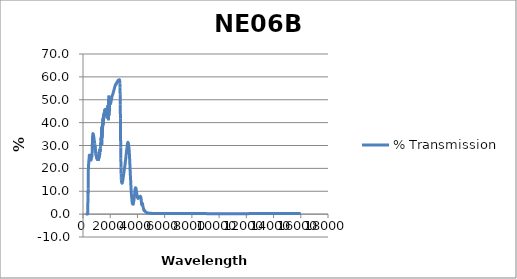
| Category | % Transmission |
|---|---|
| 200.0 | 0 |
| 201.0 | 0 |
| 202.0 | 0 |
| 203.0 | 0 |
| 204.0 | 0 |
| 205.0 | 0 |
| 206.0 | 0 |
| 207.0 | 0 |
| 208.0 | 0 |
| 209.0 | 0 |
| 210.0 | 0 |
| 211.0 | 0 |
| 212.0 | 0 |
| 213.0 | 0 |
| 214.0 | 0 |
| 215.0 | 0 |
| 216.0 | 0 |
| 217.0 | 0 |
| 218.0 | 0 |
| 219.0 | 0 |
| 220.0 | 0 |
| 221.0 | 0 |
| 222.0 | 0 |
| 223.0 | 0 |
| 224.0 | 0 |
| 225.0 | 0 |
| 226.0 | 0 |
| 227.0 | 0 |
| 228.0 | 0 |
| 229.0 | 0 |
| 230.0 | 0 |
| 231.0 | 0 |
| 232.0 | 0 |
| 233.0 | 0 |
| 234.0 | 0 |
| 235.0 | 0 |
| 236.0 | 0 |
| 237.0 | 0 |
| 238.0 | 0 |
| 239.0 | 0 |
| 240.0 | 0 |
| 241.0 | 0 |
| 242.0 | 0 |
| 243.0 | 0 |
| 244.0 | 0 |
| 245.0 | 0 |
| 246.0 | 0 |
| 247.0 | 0 |
| 248.0 | 0 |
| 249.0 | 0 |
| 250.0 | 0 |
| 251.0 | 0 |
| 252.0 | 0 |
| 253.0 | 0 |
| 254.0 | 0 |
| 255.0 | 0 |
| 256.0 | 0 |
| 257.0 | 0 |
| 258.0 | 0 |
| 259.0 | 0 |
| 260.0 | 0 |
| 261.0 | 0 |
| 262.0 | 0 |
| 263.0 | 0 |
| 264.0 | 0 |
| 265.0 | 0 |
| 266.0 | 0 |
| 267.0 | 0 |
| 268.0 | 0 |
| 269.0 | 0 |
| 270.0 | 0 |
| 271.0 | 0 |
| 272.0 | 0 |
| 273.0 | 0 |
| 274.0 | 0 |
| 275.0 | 0 |
| 276.0 | 0 |
| 277.0 | 0 |
| 278.0 | 0 |
| 279.0 | 0 |
| 280.0 | 0 |
| 281.0 | 0 |
| 282.0 | 0 |
| 283.0 | 0 |
| 284.0 | 0 |
| 285.0 | 0 |
| 286.0 | 0 |
| 287.0 | 0 |
| 288.0 | 0 |
| 289.0 | 0 |
| 290.0 | 0 |
| 291.0 | 0 |
| 292.0 | 0 |
| 293.0 | 0 |
| 294.0 | 0 |
| 295.0 | 0 |
| 296.0 | 0 |
| 297.0 | 0 |
| 298.0 | 0 |
| 299.0 | 0 |
| 300.0 | 0 |
| 301.0 | 0 |
| 302.0 | 0 |
| 303.0 | 0 |
| 304.0 | 0 |
| 305.0 | 0 |
| 306.0 | 0 |
| 307.0 | 0 |
| 308.0 | 0 |
| 309.0 | 0 |
| 310.0 | 0 |
| 311.0 | 0 |
| 312.0 | 0 |
| 313.0 | 0 |
| 314.0 | 0 |
| 315.0 | 0 |
| 316.0 | 0 |
| 317.0 | 0 |
| 318.0 | 0 |
| 319.0 | 0 |
| 320.0 | 0 |
| 321.0 | 0 |
| 322.0 | 0 |
| 323.0 | 0 |
| 324.0 | 0 |
| 325.0 | 0 |
| 326.0 | 0.001 |
| 327.0 | 0.001 |
| 328.0 | 0.002 |
| 329.0 | 0.004 |
| 330.0 | 0.006 |
| 331.0 | 0.01 |
| 332.0 | 0.016 |
| 333.0 | 0.024 |
| 334.0 | 0.035 |
| 335.0 | 0.051 |
| 336.0 | 0.073 |
| 337.0 | 0.102 |
| 338.0 | 0.141 |
| 339.0 | 0.189 |
| 340.0 | 0.251 |
| 341.0 | 0.326 |
| 342.0 | 0.416 |
| 343.0 | 0.523 |
| 344.0 | 0.648 |
| 345.0 | 0.793 |
| 346.0 | 0.96 |
| 347.0 | 1.151 |
| 348.0 | 1.368 |
| 349.0 | 1.612 |
| 350.0 | 1.881 |
| 351.0 | 2.171 |
| 352.0 | 2.48 |
| 353.0 | 2.808 |
| 354.0 | 3.157 |
| 355.0 | 3.532 |
| 356.0 | 3.931 |
| 357.0 | 4.351 |
| 358.0 | 4.788 |
| 359.0 | 5.241 |
| 360.0 | 5.709 |
| 361.0 | 6.193 |
| 362.0 | 6.681 |
| 363.0 | 7.162 |
| 364.0 | 7.629 |
| 365.0 | 8.079 |
| 366.0 | 8.518 |
| 367.0 | 8.938 |
| 368.0 | 9.319 |
| 369.0 | 9.631 |
| 370.0 | 9.847 |
| 371.0 | 9.956 |
| 372.0 | 9.961 |
| 373.0 | 9.874 |
| 374.0 | 9.721 |
| 375.0 | 9.54 |
| 376.0 | 9.386 |
| 377.0 | 9.319 |
| 378.0 | 9.386 |
| 379.0 | 9.607 |
| 380.0 | 9.984 |
| 381.0 | 10.5 |
| 382.0 | 11.128 |
| 383.0 | 11.832 |
| 384.0 | 12.58 |
| 385.0 | 13.34 |
| 386.0 | 14.097 |
| 387.0 | 14.848 |
| 388.0 | 15.586 |
| 389.0 | 16.295 |
| 390.0 | 16.955 |
| 391.0 | 17.555 |
| 392.0 | 18.1 |
| 393.0 | 18.603 |
| 394.0 | 19.082 |
| 395.0 | 19.526 |
| 396.0 | 19.921 |
| 397.0 | 20.263 |
| 398.0 | 20.562 |
| 399.0 | 20.832 |
| 400.0 | 21.075 |
| 401.0 | 21.286 |
| 402.0 | 21.449 |
| 403.0 | 21.557 |
| 404.0 | 21.618 |
| 405.0 | 21.651 |
| 406.0 | 21.672 |
| 407.0 | 21.684 |
| 408.0 | 21.682 |
| 409.0 | 21.665 |
| 410.0 | 21.639 |
| 411.0 | 21.629 |
| 412.0 | 21.648 |
| 413.0 | 21.689 |
| 414.0 | 21.732 |
| 415.0 | 21.768 |
| 416.0 | 21.81 |
| 417.0 | 21.873 |
| 418.0 | 21.967 |
| 419.0 | 22.078 |
| 420.0 | 22.187 |
| 421.0 | 22.286 |
| 422.0 | 22.383 |
| 423.0 | 22.5 |
| 424.0 | 22.638 |
| 425.0 | 22.782 |
| 426.0 | 22.905 |
| 427.0 | 22.995 |
| 428.0 | 23.064 |
| 429.0 | 23.131 |
| 430.0 | 23.205 |
| 431.0 | 23.27 |
| 432.0 | 23.302 |
| 433.0 | 23.292 |
| 434.0 | 23.258 |
| 435.0 | 23.225 |
| 436.0 | 23.202 |
| 437.0 | 23.189 |
| 438.0 | 23.166 |
| 439.0 | 23.138 |
| 440.0 | 23.122 |
| 441.0 | 23.143 |
| 442.0 | 23.209 |
| 443.0 | 23.3 |
| 444.0 | 23.402 |
| 445.0 | 23.505 |
| 446.0 | 23.625 |
| 447.0 | 23.777 |
| 448.0 | 23.961 |
| 449.0 | 24.154 |
| 450.0 | 24.33 |
| 451.0 | 24.48 |
| 452.0 | 24.617 |
| 453.0 | 24.76 |
| 454.0 | 24.913 |
| 455.0 | 25.066 |
| 456.0 | 25.197 |
| 457.0 | 25.305 |
| 458.0 | 25.403 |
| 459.0 | 25.508 |
| 460.0 | 25.619 |
| 461.0 | 25.709 |
| 462.0 | 25.758 |
| 463.0 | 25.764 |
| 464.0 | 25.753 |
| 465.0 | 25.75 |
| 466.0 | 25.758 |
| 467.0 | 25.759 |
| 468.0 | 25.729 |
| 469.0 | 25.671 |
| 470.0 | 25.604 |
| 471.0 | 25.545 |
| 472.0 | 25.5 |
| 473.0 | 25.458 |
| 474.0 | 25.404 |
| 475.0 | 25.343 |
| 476.0 | 25.287 |
| 477.0 | 25.246 |
| 478.0 | 25.215 |
| 479.0 | 25.17 |
| 480.0 | 25.096 |
| 481.0 | 25 |
| 482.0 | 24.909 |
| 483.0 | 24.849 |
| 484.0 | 24.817 |
| 485.0 | 24.794 |
| 486.0 | 24.761 |
| 487.0 | 24.705 |
| 488.0 | 24.637 |
| 489.0 | 24.569 |
| 490.0 | 24.505 |
| 491.0 | 24.446 |
| 492.0 | 24.384 |
| 493.0 | 24.33 |
| 494.0 | 24.29 |
| 495.0 | 24.269 |
| 496.0 | 24.264 |
| 497.0 | 24.254 |
| 498.0 | 24.225 |
| 499.0 | 24.179 |
| 500.0 | 24.135 |
| 501.0 | 24.11 |
| 502.0 | 24.101 |
| 503.0 | 24.094 |
| 504.0 | 24.075 |
| 505.0 | 24.044 |
| 506.0 | 24.019 |
| 507.0 | 24.018 |
| 508.0 | 24.04 |
| 509.0 | 24.072 |
| 510.0 | 24.092 |
| 511.0 | 24.094 |
| 512.0 | 24.091 |
| 513.0 | 24.096 |
| 514.0 | 24.119 |
| 515.0 | 24.15 |
| 516.0 | 24.173 |
| 517.0 | 24.19 |
| 518.0 | 24.211 |
| 519.0 | 24.255 |
| 520.0 | 24.319 |
| 521.0 | 24.384 |
| 522.0 | 24.435 |
| 523.0 | 24.47 |
| 524.0 | 24.51 |
| 525.0 | 24.564 |
| 526.0 | 24.629 |
| 527.0 | 24.695 |
| 528.0 | 24.747 |
| 529.0 | 24.802 |
| 530.0 | 24.868 |
| 531.0 | 24.952 |
| 532.0 | 25.048 |
| 533.0 | 25.136 |
| 534.0 | 25.207 |
| 535.0 | 25.264 |
| 536.0 | 25.31 |
| 537.0 | 25.353 |
| 538.0 | 25.397 |
| 539.0 | 25.44 |
| 540.0 | 25.484 |
| 541.0 | 25.522 |
| 542.0 | 25.555 |
| 543.0 | 25.587 |
| 544.0 | 25.62 |
| 545.0 | 25.66 |
| 546.0 | 25.696 |
| 547.0 | 25.717 |
| 548.0 | 25.721 |
| 549.0 | 25.711 |
| 550.0 | 25.703 |
| 551.0 | 25.706 |
| 552.0 | 25.714 |
| 553.0 | 25.707 |
| 554.0 | 25.67 |
| 555.0 | 25.62 |
| 556.0 | 25.573 |
| 557.0 | 25.539 |
| 558.0 | 25.512 |
| 559.0 | 25.475 |
| 560.0 | 25.422 |
| 561.0 | 25.363 |
| 562.0 | 25.308 |
| 563.0 | 25.252 |
| 564.0 | 25.192 |
| 565.0 | 25.129 |
| 566.0 | 25.067 |
| 567.0 | 25.008 |
| 568.0 | 24.945 |
| 569.0 | 24.88 |
| 570.0 | 24.812 |
| 571.0 | 24.741 |
| 572.0 | 24.669 |
| 573.0 | 24.591 |
| 574.0 | 24.508 |
| 575.0 | 24.429 |
| 576.0 | 24.353 |
| 577.0 | 24.278 |
| 578.0 | 24.194 |
| 579.0 | 24.108 |
| 580.0 | 24.031 |
| 581.0 | 23.964 |
| 582.0 | 23.903 |
| 583.0 | 23.84 |
| 584.0 | 23.776 |
| 585.0 | 23.72 |
| 586.0 | 23.685 |
| 587.0 | 23.671 |
| 588.0 | 23.659 |
| 589.0 | 23.642 |
| 590.0 | 23.621 |
| 591.0 | 23.607 |
| 592.0 | 23.609 |
| 593.0 | 23.617 |
| 594.0 | 23.624 |
| 595.0 | 23.626 |
| 596.0 | 23.632 |
| 597.0 | 23.66 |
| 598.0 | 23.708 |
| 599.0 | 23.767 |
| 600.0 | 23.819 |
| 601.0 | 23.853 |
| 602.0 | 23.875 |
| 603.0 | 23.892 |
| 604.0 | 23.918 |
| 605.0 | 23.961 |
| 606.0 | 24.013 |
| 607.0 | 24.066 |
| 608.0 | 24.112 |
| 609.0 | 24.152 |
| 610.0 | 24.192 |
| 611.0 | 24.238 |
| 612.0 | 24.292 |
| 613.0 | 24.347 |
| 614.0 | 24.397 |
| 615.0 | 24.446 |
| 616.0 | 24.496 |
| 617.0 | 24.551 |
| 618.0 | 24.603 |
| 619.0 | 24.643 |
| 620.0 | 24.668 |
| 621.0 | 24.68 |
| 622.0 | 24.696 |
| 623.0 | 24.725 |
| 624.0 | 24.772 |
| 625.0 | 24.821 |
| 626.0 | 24.862 |
| 627.0 | 24.882 |
| 628.0 | 24.884 |
| 629.0 | 24.882 |
| 630.0 | 24.886 |
| 631.0 | 24.896 |
| 632.0 | 24.898 |
| 633.0 | 24.884 |
| 634.0 | 24.856 |
| 635.0 | 24.835 |
| 636.0 | 24.825 |
| 637.0 | 24.83 |
| 638.0 | 24.833 |
| 639.0 | 24.832 |
| 640.0 | 24.829 |
| 641.0 | 24.833 |
| 642.0 | 24.85 |
| 643.0 | 24.873 |
| 644.0 | 24.897 |
| 645.0 | 24.918 |
| 646.0 | 24.934 |
| 647.0 | 24.943 |
| 648.0 | 24.952 |
| 649.0 | 24.968 |
| 650.0 | 24.995 |
| 651.0 | 25.026 |
| 652.0 | 25.05 |
| 653.0 | 25.075 |
| 654.0 | 25.108 |
| 655.0 | 25.155 |
| 656.0 | 25.21 |
| 657.0 | 25.262 |
| 658.0 | 25.309 |
| 659.0 | 25.366 |
| 660.0 | 25.456 |
| 661.0 | 25.569 |
| 662.0 | 25.689 |
| 663.0 | 25.802 |
| 664.0 | 25.909 |
| 665.0 | 26.026 |
| 666.0 | 26.148 |
| 667.0 | 26.294 |
| 668.0 | 26.44 |
| 669.0 | 26.585 |
| 670.0 | 26.737 |
| 671.0 | 26.896 |
| 672.0 | 27.076 |
| 673.0 | 27.267 |
| 674.0 | 27.468 |
| 675.0 | 27.669 |
| 676.0 | 27.873 |
| 677.0 | 28.088 |
| 678.0 | 28.326 |
| 679.0 | 28.563 |
| 680.0 | 28.792 |
| 681.0 | 29.007 |
| 682.0 | 29.211 |
| 683.0 | 29.438 |
| 684.0 | 29.672 |
| 685.0 | 29.919 |
| 686.0 | 30.145 |
| 687.0 | 30.355 |
| 688.0 | 30.573 |
| 689.0 | 30.804 |
| 690.0 | 31.058 |
| 691.0 | 31.301 |
| 692.0 | 31.53 |
| 693.0 | 31.727 |
| 694.0 | 31.911 |
| 695.0 | 32.085 |
| 696.0 | 32.254 |
| 697.0 | 32.424 |
| 698.0 | 32.589 |
| 699.0 | 32.761 |
| 700.0 | 32.926 |
| 701.0 | 33.1 |
| 702.0 | 33.262 |
| 703.0 | 33.411 |
| 704.0 | 33.542 |
| 705.0 | 33.655 |
| 706.0 | 33.773 |
| 707.0 | 33.888 |
| 708.0 | 34.017 |
| 709.0 | 34.124 |
| 710.0 | 34.202 |
| 711.0 | 34.263 |
| 712.0 | 34.327 |
| 713.0 | 34.415 |
| 714.0 | 34.516 |
| 715.0 | 34.609 |
| 716.0 | 34.683 |
| 717.0 | 34.728 |
| 718.0 | 34.776 |
| 719.0 | 34.821 |
| 720.0 | 34.874 |
| 721.0 | 34.926 |
| 722.0 | 34.958 |
| 723.0 | 34.992 |
| 724.0 | 35.014 |
| 725.0 | 35.047 |
| 726.0 | 35.08 |
| 727.0 | 35.097 |
| 728.0 | 35.12 |
| 729.0 | 35.122 |
| 730.0 | 35.136 |
| 731.0 | 35.164 |
| 732.0 | 35.182 |
| 733.0 | 35.198 |
| 734.0 | 35.194 |
| 735.0 | 35.186 |
| 736.0 | 35.177 |
| 737.0 | 35.174 |
| 738.0 | 35.172 |
| 739.0 | 35.162 |
| 740.0 | 35.136 |
| 741.0 | 35.12 |
| 742.0 | 35.112 |
| 743.0 | 35.121 |
| 744.0 | 35.126 |
| 745.0 | 35.112 |
| 746.0 | 35.076 |
| 747.0 | 35.037 |
| 748.0 | 35.019 |
| 749.0 | 35.015 |
| 750.0 | 35.017 |
| 751.0 | 35.005 |
| 752.0 | 34.987 |
| 753.0 | 34.973 |
| 754.0 | 34.967 |
| 755.0 | 34.971 |
| 756.0 | 34.961 |
| 757.0 | 34.933 |
| 758.0 | 34.886 |
| 759.0 | 34.843 |
| 760.0 | 34.806 |
| 761.0 | 34.782 |
| 762.0 | 34.761 |
| 763.0 | 34.73 |
| 764.0 | 34.701 |
| 765.0 | 34.674 |
| 766.0 | 34.656 |
| 767.0 | 34.639 |
| 768.0 | 34.604 |
| 769.0 | 34.56 |
| 770.0 | 34.51 |
| 771.0 | 34.46 |
| 772.0 | 34.428 |
| 773.0 | 34.402 |
| 774.0 | 34.382 |
| 775.0 | 34.355 |
| 776.0 | 34.323 |
| 777.0 | 34.293 |
| 778.0 | 34.261 |
| 779.0 | 34.233 |
| 780.0 | 34.216 |
| 781.0 | 34.187 |
| 782.0 | 34.147 |
| 783.0 | 34.092 |
| 784.0 | 34.028 |
| 785.0 | 33.962 |
| 786.0 | 33.903 |
| 787.0 | 33.859 |
| 788.0 | 33.825 |
| 789.0 | 33.799 |
| 790.0 | 33.78 |
| 791.0 | 33.749 |
| 792.0 | 33.709 |
| 793.0 | 33.664 |
| 794.0 | 33.619 |
| 795.0 | 33.576 |
| 796.0 | 33.532 |
| 797.0 | 33.489 |
| 798.0 | 33.446 |
| 799.0 | 33.412 |
| 800.0 | 33.37 |
| 801.0 | 33.321 |
| 802.0 | 33.266 |
| 803.0 | 33.211 |
| 804.0 | 33.167 |
| 805.0 | 33.129 |
| 806.0 | 33.098 |
| 807.0 | 33.057 |
| 808.0 | 33.005 |
| 809.0 | 32.956 |
| 810.0 | 32.917 |
| 811.0 | 32.888 |
| 812.0 | 32.857 |
| 813.0 | 32.822 |
| 814.0 | 32.781 |
| 815.0 | 32.738 |
| 816.0 | 32.691 |
| 817.0 | 32.631 |
| 818.0 | 32.572 |
| 819.0 | 32.507 |
| 820.0 | 32.458 |
| 821.0 | 32.41 |
| 822.0 | 32.366 |
| 823.0 | 32.337 |
| 824.0 | 32.321 |
| 825.0 | 32.312 |
| 826.0 | 32.289 |
| 827.0 | 32.251 |
| 828.0 | 32.2 |
| 829.0 | 32.137 |
| 830.0 | 32.076 |
| 831.0 | 32.028 |
| 832.0 | 31.987 |
| 833.0 | 31.959 |
| 834.0 | 31.927 |
| 835.0 | 31.891 |
| 836.0 | 31.85 |
| 837.0 | 31.81 |
| 838.0 | 31.778 |
| 839.0 | 31.741 |
| 840.0 | 31.701 |
| 841.0 | 31.656 |
| 842.0 | 31.598 |
| 843.0 | 31.543 |
| 844.0 | 31.481 |
| 845.0 | 31.428 |
| 846.0 | 31.371 |
| 847.0 | 31.31 |
| 848.0 | 31.261 |
| 849.0 | 31.229 |
| 850.0 | 31.215 |
| 851.0 | 31.202 |
| 852.0 | 31.175 |
| 853.0 | 31.124 |
| 854.0 | 31.053 |
| 855.0 | 30.98 |
| 856.0 | 30.922 |
| 857.0 | 30.882 |
| 858.0 | 30.848 |
| 859.0 | 30.762 |
| 860.0 | 30.541 |
| 861.0 | 30.185 |
| 862.0 | 29.792 |
| 863.0 | 29.55 |
| 864.0 | 29.58 |
| 865.0 | 29.873 |
| 866.0 | 30.21 |
| 867.0 | 30.339 |
| 868.0 | 30.178 |
| 869.0 | 29.789 |
| 870.0 | 29.372 |
| 871.0 | 29.097 |
| 872.0 | 29.055 |
| 873.0 | 29.205 |
| 874.0 | 29.428 |
| 875.0 | 29.609 |
| 876.0 | 29.661 |
| 877.0 | 29.567 |
| 878.0 | 29.399 |
| 879.0 | 29.265 |
| 880.0 | 29.234 |
| 881.0 | 29.316 |
| 882.0 | 29.419 |
| 883.0 | 29.41 |
| 884.0 | 29.247 |
| 885.0 | 29.044 |
| 886.0 | 28.96 |
| 887.0 | 29.005 |
| 888.0 | 29.062 |
| 889.0 | 28.985 |
| 890.0 | 28.772 |
| 891.0 | 28.587 |
| 892.0 | 28.588 |
| 893.0 | 28.787 |
| 894.0 | 28.988 |
| 895.0 | 29.001 |
| 896.0 | 28.793 |
| 897.0 | 28.495 |
| 898.0 | 28.324 |
| 899.0 | 28.366 |
| 900.0 | 28.497 |
| 901.0 | 28.513 |
| 902.0 | 28.351 |
| 903.0 | 28.154 |
| 904.0 | 28.095 |
| 905.0 | 28.193 |
| 906.0 | 28.341 |
| 907.0 | 28.413 |
| 908.0 | 28.348 |
| 909.0 | 28.158 |
| 910.0 | 27.906 |
| 911.0 | 27.694 |
| 912.0 | 27.583 |
| 913.0 | 27.573 |
| 914.0 | 27.587 |
| 915.0 | 27.542 |
| 916.0 | 27.49 |
| 917.0 | 27.557 |
| 918.0 | 27.777 |
| 919.0 | 27.964 |
| 920.0 | 27.936 |
| 921.0 | 27.727 |
| 922.0 | 27.535 |
| 923.0 | 27.497 |
| 924.0 | 27.527 |
| 925.0 | 27.477 |
| 926.0 | 27.331 |
| 927.0 | 27.24 |
| 928.0 | 27.309 |
| 929.0 | 27.412 |
| 930.0 | 27.336 |
| 931.0 | 27.034 |
| 932.0 | 26.694 |
| 933.0 | 26.592 |
| 934.0 | 26.753 |
| 935.0 | 26.981 |
| 936.0 | 27.089 |
| 937.0 | 27.026 |
| 938.0 | 26.905 |
| 939.0 | 26.847 |
| 940.0 | 26.867 |
| 941.0 | 26.87 |
| 942.0 | 26.793 |
| 943.0 | 26.667 |
| 944.0 | 26.566 |
| 945.0 | 26.556 |
| 946.0 | 26.597 |
| 947.0 | 26.595 |
| 948.0 | 26.506 |
| 949.0 | 26.394 |
| 950.0 | 26.341 |
| 951.0 | 26.325 |
| 952.0 | 26.3 |
| 953.0 | 26.216 |
| 954.0 | 26.119 |
| 955.0 | 26.095 |
| 956.0 | 26.185 |
| 957.0 | 26.287 |
| 958.0 | 26.272 |
| 959.0 | 26.167 |
| 960.0 | 26.023 |
| 961.0 | 25.977 |
| 962.0 | 26.041 |
| 963.0 | 26.134 |
| 964.0 | 26.207 |
| 965.0 | 26.2 |
| 966.0 | 26.14 |
| 967.0 | 25.996 |
| 968.0 | 25.804 |
| 969.0 | 25.635 |
| 970.0 | 25.585 |
| 971.0 | 25.709 |
| 972.0 | 25.89 |
| 973.0 | 26.003 |
| 974.0 | 25.992 |
| 975.0 | 25.922 |
| 976.0 | 25.85 |
| 977.0 | 25.818 |
| 978.0 | 25.799 |
| 979.0 | 25.736 |
| 980.0 | 25.598 |
| 981.0 | 25.439 |
| 982.0 | 25.306 |
| 983.0 | 25.251 |
| 984.0 | 25.36 |
| 985.0 | 25.568 |
| 986.0 | 25.761 |
| 987.0 | 25.804 |
| 988.0 | 25.678 |
| 989.0 | 25.516 |
| 990.0 | 25.383 |
| 991.0 | 25.339 |
| 992.0 | 25.282 |
| 993.0 | 25.115 |
| 994.0 | 24.949 |
| 995.0 | 24.844 |
| 996.0 | 24.893 |
| 997.0 | 24.998 |
| 998.0 | 25.105 |
| 999.0 | 25.201 |
| 1000.0 | 25.247 |
| 1001.0 | 25.23 |
| 1002.0 | 25.098 |
| 1003.0 | 24.976 |
| 1004.0 | 24.958 |
| 1005.0 | 25.102 |
| 1006.0 | 25.25 |
| 1007.0 | 25.226 |
| 1008.0 | 25.039 |
| 1009.0 | 24.829 |
| 1010.0 | 24.786 |
| 1011.0 | 24.917 |
| 1012.0 | 25.054 |
| 1013.0 | 25.035 |
| 1014.0 | 24.837 |
| 1015.0 | 24.632 |
| 1016.0 | 24.605 |
| 1017.0 | 24.754 |
| 1018.0 | 24.963 |
| 1019.0 | 24.998 |
| 1020.0 | 24.823 |
| 1021.0 | 24.586 |
| 1022.0 | 24.477 |
| 1023.0 | 24.575 |
| 1024.0 | 24.733 |
| 1025.0 | 24.81 |
| 1026.0 | 24.731 |
| 1027.0 | 24.604 |
| 1028.0 | 24.561 |
| 1029.0 | 24.642 |
| 1030.0 | 24.762 |
| 1031.0 | 24.79 |
| 1032.0 | 24.661 |
| 1033.0 | 24.393 |
| 1034.0 | 24.171 |
| 1035.0 | 24.09 |
| 1036.0 | 24.195 |
| 1037.0 | 24.385 |
| 1038.0 | 24.5 |
| 1039.0 | 24.467 |
| 1040.0 | 24.355 |
| 1041.0 | 24.304 |
| 1042.0 | 24.358 |
| 1043.0 | 24.473 |
| 1044.0 | 24.539 |
| 1045.0 | 24.518 |
| 1046.0 | 24.345 |
| 1047.0 | 24.111 |
| 1048.0 | 23.964 |
| 1049.0 | 23.949 |
| 1050.0 | 24.135 |
| 1051.0 | 24.373 |
| 1052.0 | 24.532 |
| 1053.0 | 24.524 |
| 1054.0 | 24.331 |
| 1055.0 | 24.081 |
| 1056.0 | 23.931 |
| 1057.0 | 23.953 |
| 1058.0 | 24.17 |
| 1059.0 | 24.469 |
| 1060.0 | 24.677 |
| 1061.0 | 24.746 |
| 1062.0 | 24.656 |
| 1063.0 | 24.476 |
| 1064.0 | 24.217 |
| 1065.0 | 23.885 |
| 1066.0 | 23.573 |
| 1067.0 | 23.463 |
| 1068.0 | 23.592 |
| 1069.0 | 23.931 |
| 1070.0 | 24.298 |
| 1071.0 | 24.539 |
| 1072.0 | 24.618 |
| 1073.0 | 24.508 |
| 1074.0 | 24.286 |
| 1075.0 | 23.988 |
| 1076.0 | 23.806 |
| 1077.0 | 23.828 |
| 1078.0 | 24.048 |
| 1079.0 | 24.308 |
| 1080.0 | 24.417 |
| 1081.0 | 24.327 |
| 1082.0 | 24.066 |
| 1083.0 | 23.885 |
| 1084.0 | 23.86 |
| 1085.0 | 23.996 |
| 1086.0 | 24.211 |
| 1087.0 | 24.36 |
| 1088.0 | 24.38 |
| 1089.0 | 24.235 |
| 1090.0 | 24.027 |
| 1091.0 | 23.931 |
| 1092.0 | 23.969 |
| 1093.0 | 24.189 |
| 1094.0 | 24.448 |
| 1095.0 | 24.581 |
| 1096.0 | 24.519 |
| 1097.0 | 24.27 |
| 1098.0 | 23.973 |
| 1099.0 | 23.722 |
| 1100.0 | 23.678 |
| 1101.0 | 23.856 |
| 1102.0 | 24.23 |
| 1103.0 | 24.62 |
| 1104.0 | 24.895 |
| 1105.0 | 24.966 |
| 1106.0 | 24.849 |
| 1107.0 | 24.669 |
| 1108.0 | 24.493 |
| 1109.0 | 24.359 |
| 1110.0 | 24.273 |
| 1111.0 | 24.191 |
| 1112.0 | 24.081 |
| 1113.0 | 23.988 |
| 1114.0 | 23.89 |
| 1115.0 | 23.815 |
| 1116.0 | 23.722 |
| 1117.0 | 23.602 |
| 1118.0 | 23.463 |
| 1119.0 | 23.362 |
| 1120.0 | 23.43 |
| 1121.0 | 23.645 |
| 1122.0 | 23.932 |
| 1123.0 | 24.153 |
| 1124.0 | 24.261 |
| 1125.0 | 24.387 |
| 1126.0 | 24.592 |
| 1127.0 | 24.878 |
| 1128.0 | 25.002 |
| 1129.0 | 24.743 |
| 1130.0 | 24.193 |
| 1131.0 | 23.612 |
| 1132.0 | 23.428 |
| 1133.0 | 23.622 |
| 1134.0 | 23.932 |
| 1135.0 | 24.043 |
| 1136.0 | 23.952 |
| 1137.0 | 23.857 |
| 1138.0 | 23.972 |
| 1139.0 | 24.275 |
| 1140.0 | 24.536 |
| 1141.0 | 24.685 |
| 1142.0 | 24.701 |
| 1143.0 | 24.728 |
| 1144.0 | 24.731 |
| 1145.0 | 24.677 |
| 1146.0 | 24.547 |
| 1147.0 | 24.38 |
| 1148.0 | 24.307 |
| 1149.0 | 24.381 |
| 1150.0 | 24.596 |
| 1151.0 | 24.842 |
| 1152.0 | 25.016 |
| 1153.0 | 25.093 |
| 1154.0 | 25.078 |
| 1155.0 | 24.999 |
| 1156.0 | 24.846 |
| 1157.0 | 24.627 |
| 1158.0 | 24.389 |
| 1159.0 | 24.181 |
| 1160.0 | 24.066 |
| 1161.0 | 24.127 |
| 1162.0 | 24.374 |
| 1163.0 | 24.748 |
| 1164.0 | 25.133 |
| 1165.0 | 25.38 |
| 1166.0 | 25.464 |
| 1167.0 | 25.434 |
| 1168.0 | 25.377 |
| 1169.0 | 25.346 |
| 1170.0 | 25.318 |
| 1171.0 | 25.306 |
| 1172.0 | 25.316 |
| 1173.0 | 25.348 |
| 1174.0 | 25.399 |
| 1175.0 | 25.47 |
| 1176.0 | 25.548 |
| 1177.0 | 25.622 |
| 1178.0 | 25.642 |
| 1179.0 | 25.589 |
| 1180.0 | 25.428 |
| 1181.0 | 25.214 |
| 1182.0 | 24.998 |
| 1183.0 | 24.883 |
| 1184.0 | 25.001 |
| 1185.0 | 25.391 |
| 1186.0 | 26.084 |
| 1187.0 | 26.825 |
| 1188.0 | 27.232 |
| 1189.0 | 27.143 |
| 1190.0 | 26.595 |
| 1191.0 | 25.96 |
| 1192.0 | 25.478 |
| 1193.0 | 25.223 |
| 1194.0 | 25.166 |
| 1195.0 | 25.226 |
| 1196.0 | 25.403 |
| 1197.0 | 25.631 |
| 1198.0 | 25.775 |
| 1199.0 | 25.767 |
| 1200.0 | 25.742 |
| 1201.0 | 25.744 |
| 1202.0 | 25.826 |
| 1203.0 | 25.877 |
| 1204.0 | 25.906 |
| 1205.0 | 25.972 |
| 1206.0 | 26.098 |
| 1207.0 | 26.261 |
| 1208.0 | 26.335 |
| 1209.0 | 26.31 |
| 1210.0 | 26.23 |
| 1211.0 | 26.195 |
| 1212.0 | 26.252 |
| 1213.0 | 26.381 |
| 1214.0 | 26.566 |
| 1215.0 | 26.691 |
| 1216.0 | 26.652 |
| 1217.0 | 26.452 |
| 1218.0 | 26.176 |
| 1219.0 | 26.008 |
| 1220.0 | 26.02 |
| 1221.0 | 26.161 |
| 1222.0 | 26.287 |
| 1223.0 | 26.293 |
| 1224.0 | 26.207 |
| 1225.0 | 26.124 |
| 1226.0 | 26.115 |
| 1227.0 | 26.21 |
| 1228.0 | 26.395 |
| 1229.0 | 26.579 |
| 1230.0 | 26.7 |
| 1231.0 | 26.705 |
| 1232.0 | 26.621 |
| 1233.0 | 26.507 |
| 1234.0 | 26.415 |
| 1235.0 | 26.438 |
| 1236.0 | 26.603 |
| 1237.0 | 26.867 |
| 1238.0 | 27.154 |
| 1239.0 | 27.351 |
| 1240.0 | 27.43 |
| 1241.0 | 27.407 |
| 1242.0 | 27.343 |
| 1243.0 | 27.332 |
| 1244.0 | 27.433 |
| 1245.0 | 27.681 |
| 1246.0 | 28.053 |
| 1247.0 | 28.342 |
| 1248.0 | 28.348 |
| 1249.0 | 28.059 |
| 1250.0 | 27.612 |
| 1251.0 | 27.282 |
| 1252.0 | 27.175 |
| 1253.0 | 27.278 |
| 1254.0 | 27.493 |
| 1255.0 | 27.67 |
| 1256.0 | 27.786 |
| 1257.0 | 27.842 |
| 1258.0 | 27.882 |
| 1259.0 | 27.946 |
| 1260.0 | 27.98 |
| 1261.0 | 27.925 |
| 1262.0 | 27.767 |
| 1263.0 | 27.601 |
| 1264.0 | 27.585 |
| 1265.0 | 27.801 |
| 1266.0 | 28.18 |
| 1267.0 | 28.507 |
| 1268.0 | 28.598 |
| 1269.0 | 28.43 |
| 1270.0 | 28.09 |
| 1271.0 | 27.744 |
| 1272.0 | 27.569 |
| 1273.0 | 27.643 |
| 1274.0 | 27.953 |
| 1275.0 | 28.399 |
| 1276.0 | 28.831 |
| 1277.0 | 29.15 |
| 1278.0 | 29.265 |
| 1279.0 | 29.201 |
| 1280.0 | 29.026 |
| 1281.0 | 28.867 |
| 1282.0 | 28.882 |
| 1283.0 | 29.068 |
| 1284.0 | 29.346 |
| 1285.0 | 29.555 |
| 1286.0 | 29.631 |
| 1287.0 | 29.607 |
| 1288.0 | 29.558 |
| 1289.0 | 29.547 |
| 1290.0 | 29.552 |
| 1291.0 | 29.583 |
| 1292.0 | 29.66 |
| 1293.0 | 29.794 |
| 1294.0 | 29.999 |
| 1295.0 | 30.24 |
| 1296.0 | 30.452 |
| 1297.0 | 30.523 |
| 1298.0 | 30.397 |
| 1299.0 | 30.142 |
| 1300.0 | 29.917 |
| 1301.0 | 29.872 |
| 1302.0 | 30.029 |
| 1303.0 | 30.325 |
| 1304.0 | 30.677 |
| 1305.0 | 31.037 |
| 1306.0 | 31.288 |
| 1307.0 | 31.353 |
| 1308.0 | 31.202 |
| 1309.0 | 30.882 |
| 1310.0 | 30.559 |
| 1311.0 | 30.315 |
| 1312.0 | 30.195 |
| 1313.0 | 30.164 |
| 1314.0 | 30.173 |
| 1315.0 | 30.247 |
| 1316.0 | 30.35 |
| 1317.0 | 30.477 |
| 1318.0 | 30.628 |
| 1319.0 | 30.767 |
| 1320.0 | 30.915 |
| 1321.0 | 31.057 |
| 1322.0 | 31.21 |
| 1323.0 | 31.38 |
| 1324.0 | 31.565 |
| 1325.0 | 31.766 |
| 1326.0 | 31.972 |
| 1327.0 | 32.21 |
| 1328.0 | 32.512 |
| 1329.0 | 32.846 |
| 1330.0 | 33.056 |
| 1331.0 | 33.013 |
| 1332.0 | 32.688 |
| 1333.0 | 32.259 |
| 1334.0 | 31.96 |
| 1335.0 | 31.926 |
| 1336.0 | 32.133 |
| 1337.0 | 32.431 |
| 1338.0 | 32.67 |
| 1339.0 | 32.799 |
| 1340.0 | 32.895 |
| 1341.0 | 33.015 |
| 1342.0 | 33.125 |
| 1343.0 | 33.09 |
| 1344.0 | 32.954 |
| 1345.0 | 32.904 |
| 1346.0 | 33.135 |
| 1347.0 | 33.57 |
| 1348.0 | 33.866 |
| 1349.0 | 33.606 |
| 1350.0 | 32.777 |
| 1351.0 | 31.95 |
| 1352.0 | 31.925 |
| 1353.0 | 33.014 |
| 1354.0 | 34.595 |
| 1355.0 | 35.508 |
| 1356.0 | 34.798 |
| 1357.0 | 32.717 |
| 1358.0 | 30.763 |
| 1359.0 | 30.369 |
| 1360.0 | 31.697 |
| 1361.0 | 33.765 |
| 1362.0 | 35.279 |
| 1363.0 | 35.563 |
| 1364.0 | 34.934 |
| 1365.0 | 34.047 |
| 1366.0 | 33.393 |
| 1367.0 | 33.054 |
| 1368.0 | 33.14 |
| 1369.0 | 33.791 |
| 1370.0 | 34.791 |
| 1371.0 | 35.842 |
| 1372.0 | 36.71 |
| 1373.0 | 37.311 |
| 1374.0 | 37.66 |
| 1375.0 | 37.549 |
| 1376.0 | 36.482 |
| 1377.0 | 34.339 |
| 1378.0 | 31.818 |
| 1379.0 | 30.284 |
| 1380.0 | 30.724 |
| 1381.0 | 32.79 |
| 1382.0 | 35.083 |
| 1383.0 | 36.264 |
| 1384.0 | 36.174 |
| 1385.0 | 35.87 |
| 1386.0 | 36.287 |
| 1387.0 | 37.226 |
| 1388.0 | 37.813 |
| 1389.0 | 37.25 |
| 1390.0 | 35.647 |
| 1391.0 | 33.913 |
| 1392.0 | 33.276 |
| 1393.0 | 34.368 |
| 1394.0 | 36.028 |
| 1395.0 | 36.84 |
| 1396.0 | 36.029 |
| 1397.0 | 34.689 |
| 1398.0 | 34.496 |
| 1399.0 | 35.736 |
| 1400.0 | 37.506 |
| 1401.0 | 38.105 |
| 1402.0 | 37.429 |
| 1403.0 | 36.322 |
| 1404.0 | 35.574 |
| 1405.0 | 35.478 |
| 1406.0 | 35.908 |
| 1407.0 | 36.963 |
| 1408.0 | 38.157 |
| 1409.0 | 38.642 |
| 1410.0 | 37.935 |
| 1411.0 | 36.755 |
| 1412.0 | 36 |
| 1413.0 | 36.034 |
| 1414.0 | 36.425 |
| 1415.0 | 36.657 |
| 1416.0 | 36.76 |
| 1417.0 | 36.929 |
| 1418.0 | 37.195 |
| 1419.0 | 37.215 |
| 1420.0 | 37.099 |
| 1421.0 | 37.166 |
| 1422.0 | 37.687 |
| 1423.0 | 38.253 |
| 1424.0 | 38.429 |
| 1425.0 | 38.087 |
| 1426.0 | 37.472 |
| 1427.0 | 37.067 |
| 1428.0 | 37.025 |
| 1429.0 | 37.271 |
| 1430.0 | 37.578 |
| 1431.0 | 37.828 |
| 1432.0 | 38.002 |
| 1433.0 | 38.104 |
| 1434.0 | 38.252 |
| 1435.0 | 38.584 |
| 1436.0 | 38.981 |
| 1437.0 | 39.12 |
| 1438.0 | 38.869 |
| 1439.0 | 38.304 |
| 1440.0 | 37.727 |
| 1441.0 | 37.507 |
| 1442.0 | 37.863 |
| 1443.0 | 38.654 |
| 1444.0 | 39.437 |
| 1445.0 | 39.7 |
| 1446.0 | 39.449 |
| 1447.0 | 38.967 |
| 1448.0 | 38.687 |
| 1449.0 | 38.859 |
| 1450.0 | 39.183 |
| 1451.0 | 39.47 |
| 1452.0 | 39.586 |
| 1453.0 | 39.756 |
| 1454.0 | 40.033 |
| 1455.0 | 40.165 |
| 1456.0 | 40.128 |
| 1457.0 | 39.961 |
| 1458.0 | 39.913 |
| 1459.0 | 40.032 |
| 1460.0 | 40.132 |
| 1461.0 | 40.118 |
| 1462.0 | 39.905 |
| 1463.0 | 39.787 |
| 1464.0 | 39.852 |
| 1465.0 | 39.872 |
| 1466.0 | 39.73 |
| 1467.0 | 39.404 |
| 1468.0 | 39.324 |
| 1469.0 | 39.698 |
| 1470.0 | 40.483 |
| 1471.0 | 41.31 |
| 1472.0 | 41.528 |
| 1473.0 | 41.149 |
| 1474.0 | 40.308 |
| 1475.0 | 39.541 |
| 1476.0 | 39.118 |
| 1477.0 | 39.302 |
| 1478.0 | 40.028 |
| 1479.0 | 41.023 |
| 1480.0 | 41.917 |
| 1481.0 | 42.238 |
| 1482.0 | 42.008 |
| 1483.0 | 41.35 |
| 1484.0 | 40.838 |
| 1485.0 | 40.581 |
| 1486.0 | 40.539 |
| 1487.0 | 40.576 |
| 1488.0 | 40.538 |
| 1489.0 | 40.518 |
| 1490.0 | 40.544 |
| 1491.0 | 40.665 |
| 1492.0 | 40.841 |
| 1493.0 | 41.114 |
| 1494.0 | 41.447 |
| 1495.0 | 41.811 |
| 1496.0 | 42.065 |
| 1497.0 | 41.968 |
| 1498.0 | 41.574 |
| 1499.0 | 41.063 |
| 1500.0 | 40.759 |
| 1501.0 | 40.873 |
| 1502.0 | 41.287 |
| 1503.0 | 41.885 |
| 1504.0 | 42.332 |
| 1505.0 | 42.426 |
| 1506.0 | 42.2 |
| 1507.0 | 41.754 |
| 1508.0 | 41.48 |
| 1509.0 | 41.602 |
| 1510.0 | 42.101 |
| 1511.0 | 42.696 |
| 1512.0 | 42.915 |
| 1513.0 | 42.734 |
| 1514.0 | 42.286 |
| 1515.0 | 41.863 |
| 1516.0 | 41.732 |
| 1517.0 | 41.913 |
| 1518.0 | 42.334 |
| 1519.0 | 42.639 |
| 1520.0 | 42.75 |
| 1521.0 | 42.663 |
| 1522.0 | 42.513 |
| 1523.0 | 42.464 |
| 1524.0 | 42.562 |
| 1525.0 | 42.802 |
| 1526.0 | 43.002 |
| 1527.0 | 42.959 |
| 1528.0 | 42.699 |
| 1529.0 | 42.269 |
| 1530.0 | 41.936 |
| 1531.0 | 41.9 |
| 1532.0 | 42.14 |
| 1533.0 | 42.602 |
| 1534.0 | 43.061 |
| 1535.0 | 43.534 |
| 1536.0 | 43.9 |
| 1537.0 | 43.948 |
| 1538.0 | 43.665 |
| 1539.0 | 43.13 |
| 1540.0 | 42.68 |
| 1541.0 | 42.45 |
| 1542.0 | 42.508 |
| 1543.0 | 42.727 |
| 1544.0 | 42.961 |
| 1545.0 | 43.216 |
| 1546.0 | 43.406 |
| 1547.0 | 43.479 |
| 1548.0 | 43.333 |
| 1549.0 | 43.065 |
| 1550.0 | 42.833 |
| 1551.0 | 42.795 |
| 1552.0 | 42.968 |
| 1553.0 | 43.307 |
| 1554.0 | 43.603 |
| 1555.0 | 43.68 |
| 1556.0 | 43.533 |
| 1557.0 | 43.254 |
| 1558.0 | 43.059 |
| 1559.0 | 43.062 |
| 1560.0 | 43.281 |
| 1561.0 | 43.682 |
| 1562.0 | 44.104 |
| 1563.0 | 44.362 |
| 1564.0 | 44.39 |
| 1565.0 | 44.178 |
| 1566.0 | 43.951 |
| 1567.0 | 43.889 |
| 1568.0 | 43.951 |
| 1569.0 | 43.944 |
| 1570.0 | 43.744 |
| 1571.0 | 43.435 |
| 1572.0 | 43.273 |
| 1573.0 | 43.357 |
| 1574.0 | 43.612 |
| 1575.0 | 43.867 |
| 1576.0 | 43.906 |
| 1577.0 | 43.791 |
| 1578.0 | 43.58 |
| 1579.0 | 43.44 |
| 1580.0 | 43.477 |
| 1581.0 | 43.682 |
| 1582.0 | 43.995 |
| 1583.0 | 44.247 |
| 1584.0 | 44.317 |
| 1585.0 | 44.092 |
| 1586.0 | 43.674 |
| 1587.0 | 43.277 |
| 1588.0 | 43.08 |
| 1589.0 | 43.128 |
| 1590.0 | 43.305 |
| 1591.0 | 43.497 |
| 1592.0 | 43.644 |
| 1593.0 | 43.779 |
| 1594.0 | 43.912 |
| 1595.0 | 44.041 |
| 1596.0 | 44.139 |
| 1597.0 | 44.227 |
| 1598.0 | 44.317 |
| 1599.0 | 44.444 |
| 1600.0 | 44.621 |
| 1601.0 | 44.875 |
| 1602.0 | 45.193 |
| 1603.0 | 45.541 |
| 1604.0 | 45.848 |
| 1605.0 | 45.983 |
| 1606.0 | 45.809 |
| 1607.0 | 45.339 |
| 1608.0 | 44.716 |
| 1609.0 | 44.187 |
| 1610.0 | 43.922 |
| 1611.0 | 43.92 |
| 1612.0 | 44.054 |
| 1613.0 | 44.124 |
| 1614.0 | 44.098 |
| 1615.0 | 43.996 |
| 1616.0 | 43.875 |
| 1617.0 | 43.809 |
| 1618.0 | 43.842 |
| 1619.0 | 44.038 |
| 1620.0 | 44.422 |
| 1621.0 | 44.863 |
| 1622.0 | 45.149 |
| 1623.0 | 45.131 |
| 1624.0 | 44.846 |
| 1625.0 | 44.523 |
| 1626.0 | 44.352 |
| 1627.0 | 44.404 |
| 1628.0 | 44.57 |
| 1629.0 | 44.669 |
| 1630.0 | 44.631 |
| 1631.0 | 44.478 |
| 1632.0 | 44.303 |
| 1633.0 | 44.231 |
| 1634.0 | 44.31 |
| 1635.0 | 44.49 |
| 1636.0 | 44.642 |
| 1637.0 | 44.668 |
| 1638.0 | 44.594 |
| 1639.0 | 44.499 |
| 1640.0 | 44.497 |
| 1641.0 | 44.61 |
| 1642.0 | 44.71 |
| 1643.0 | 44.647 |
| 1644.0 | 44.405 |
| 1645.0 | 44.144 |
| 1646.0 | 44.067 |
| 1647.0 | 44.221 |
| 1648.0 | 44.545 |
| 1649.0 | 44.846 |
| 1650.0 | 44.92 |
| 1651.0 | 44.757 |
| 1652.0 | 44.469 |
| 1653.0 | 44.237 |
| 1654.0 | 44.222 |
| 1655.0 | 44.423 |
| 1656.0 | 44.745 |
| 1657.0 | 45.084 |
| 1658.0 | 45.4 |
| 1659.0 | 45.753 |
| 1660.0 | 46.105 |
| 1661.0 | 46.306 |
| 1662.0 | 46.22 |
| 1663.0 | 45.814 |
| 1664.0 | 45.245 |
| 1665.0 | 44.799 |
| 1666.0 | 44.656 |
| 1667.0 | 44.81 |
| 1668.0 | 44.999 |
| 1669.0 | 44.984 |
| 1670.0 | 44.715 |
| 1671.0 | 44.312 |
| 1672.0 | 43.986 |
| 1673.0 | 43.857 |
| 1674.0 | 43.947 |
| 1675.0 | 44.24 |
| 1676.0 | 44.681 |
| 1677.0 | 45.079 |
| 1678.0 | 45.245 |
| 1679.0 | 45.035 |
| 1680.0 | 44.573 |
| 1681.0 | 44.117 |
| 1682.0 | 43.831 |
| 1683.0 | 43.798 |
| 1684.0 | 43.991 |
| 1685.0 | 44.44 |
| 1686.0 | 45.116 |
| 1687.0 | 45.694 |
| 1688.0 | 45.856 |
| 1689.0 | 45.475 |
| 1690.0 | 44.806 |
| 1691.0 | 44.272 |
| 1692.0 | 44.063 |
| 1693.0 | 44.171 |
| 1694.0 | 44.441 |
| 1695.0 | 44.833 |
| 1696.0 | 45.256 |
| 1697.0 | 45.505 |
| 1698.0 | 45.416 |
| 1699.0 | 44.945 |
| 1700.0 | 44.361 |
| 1701.0 | 43.952 |
| 1702.0 | 43.83 |
| 1703.0 | 43.875 |
| 1704.0 | 43.877 |
| 1705.0 | 43.794 |
| 1706.0 | 43.72 |
| 1707.0 | 43.861 |
| 1708.0 | 44.265 |
| 1709.0 | 44.884 |
| 1710.0 | 45.571 |
| 1711.0 | 46.143 |
| 1712.0 | 46.403 |
| 1713.0 | 46.225 |
| 1714.0 | 45.67 |
| 1715.0 | 44.982 |
| 1716.0 | 44.4 |
| 1717.0 | 44.051 |
| 1718.0 | 43.931 |
| 1719.0 | 43.891 |
| 1720.0 | 43.912 |
| 1721.0 | 44.037 |
| 1722.0 | 44.301 |
| 1723.0 | 44.704 |
| 1724.0 | 45.181 |
| 1725.0 | 45.683 |
| 1726.0 | 46.127 |
| 1727.0 | 46.28 |
| 1728.0 | 46.097 |
| 1729.0 | 45.597 |
| 1730.0 | 44.973 |
| 1731.0 | 44.456 |
| 1732.0 | 44.122 |
| 1733.0 | 43.958 |
| 1734.0 | 43.808 |
| 1735.0 | 43.682 |
| 1736.0 | 43.621 |
| 1737.0 | 43.666 |
| 1738.0 | 43.902 |
| 1739.0 | 44.304 |
| 1740.0 | 44.827 |
| 1741.0 | 45.383 |
| 1742.0 | 45.9 |
| 1743.0 | 46.323 |
| 1744.0 | 46.427 |
| 1745.0 | 46.232 |
| 1746.0 | 45.732 |
| 1747.0 | 45.112 |
| 1748.0 | 44.6 |
| 1749.0 | 44.296 |
| 1750.0 | 44.222 |
| 1751.0 | 44.241 |
| 1752.0 | 44.342 |
| 1753.0 | 44.467 |
| 1754.0 | 44.579 |
| 1755.0 | 44.627 |
| 1756.0 | 44.653 |
| 1757.0 | 44.698 |
| 1758.0 | 44.91 |
| 1759.0 | 45.337 |
| 1760.0 | 45.699 |
| 1761.0 | 45.808 |
| 1762.0 | 45.486 |
| 1763.0 | 44.96 |
| 1764.0 | 44.48 |
| 1765.0 | 44.206 |
| 1766.0 | 44.168 |
| 1767.0 | 44.209 |
| 1768.0 | 44.287 |
| 1769.0 | 44.32 |
| 1770.0 | 44.287 |
| 1771.0 | 44.164 |
| 1772.0 | 44.027 |
| 1773.0 | 43.919 |
| 1774.0 | 43.896 |
| 1775.0 | 44.078 |
| 1776.0 | 44.417 |
| 1777.0 | 44.825 |
| 1778.0 | 45.168 |
| 1779.0 | 45.434 |
| 1780.0 | 45.716 |
| 1781.0 | 45.972 |
| 1782.0 | 46.112 |
| 1783.0 | 46.045 |
| 1784.0 | 45.789 |
| 1785.0 | 45.531 |
| 1786.0 | 45.404 |
| 1787.0 | 45.346 |
| 1788.0 | 45.367 |
| 1789.0 | 45.41 |
| 1790.0 | 45.568 |
| 1791.0 | 45.802 |
| 1792.0 | 46.002 |
| 1793.0 | 46.283 |
| 1794.0 | 46.506 |
| 1795.0 | 46.502 |
| 1796.0 | 46.157 |
| 1797.0 | 45.601 |
| 1798.0 | 45.259 |
| 1799.0 | 45.305 |
| 1800.0 | 45.596 |
| 1801.0 | 45.734 |
| 1802.0 | 45.61 |
| 1803.0 | 45.482 |
| 1804.0 | 45.71 |
| 1805.0 | 46.194 |
| 1806.0 | 46.387 |
| 1807.0 | 46.097 |
| 1808.0 | 45.505 |
| 1809.0 | 44.936 |
| 1810.0 | 44.785 |
| 1811.0 | 45.045 |
| 1812.0 | 45.787 |
| 1813.0 | 46.182 |
| 1814.0 | 46.85 |
| 1815.0 | 46.432 |
| 1816.0 | 45.206 |
| 1817.0 | 42.794 |
| 1818.0 | 41.821 |
| 1819.0 | 41.852 |
| 1820.0 | 42.505 |
| 1821.0 | 43.307 |
| 1822.0 | 43.364 |
| 1823.0 | 43.302 |
| 1824.0 | 42.556 |
| 1825.0 | 42.437 |
| 1826.0 | 42.811 |
| 1827.0 | 43.704 |
| 1828.0 | 45.337 |
| 1829.0 | 46.381 |
| 1830.0 | 46.934 |
| 1831.0 | 46.81 |
| 1832.0 | 46.011 |
| 1833.0 | 44.786 |
| 1834.0 | 43.516 |
| 1835.0 | 42.91 |
| 1836.0 | 42.223 |
| 1837.0 | 41.651 |
| 1838.0 | 42.612 |
| 1839.0 | 44.512 |
| 1840.0 | 46.965 |
| 1841.0 | 47.659 |
| 1842.0 | 46.683 |
| 1843.0 | 45.138 |
| 1844.0 | 44.059 |
| 1845.0 | 44.525 |
| 1846.0 | 44.992 |
| 1847.0 | 45.769 |
| 1848.0 | 45.761 |
| 1849.0 | 45.753 |
| 1850.0 | 45.226 |
| 1851.0 | 45.062 |
| 1852.0 | 45.682 |
| 1853.0 | 46.621 |
| 1854.0 | 47.499 |
| 1855.0 | 46.853 |
| 1856.0 | 45.558 |
| 1857.0 | 44.453 |
| 1858.0 | 43.928 |
| 1859.0 | 44.253 |
| 1860.0 | 44.763 |
| 1861.0 | 45.302 |
| 1862.0 | 45.809 |
| 1863.0 | 45.773 |
| 1864.0 | 45.237 |
| 1865.0 | 43.851 |
| 1866.0 | 42.259 |
| 1867.0 | 41.308 |
| 1868.0 | 41.012 |
| 1869.0 | 41.219 |
| 1870.0 | 42.046 |
| 1871.0 | 43.021 |
| 1872.0 | 44.235 |
| 1873.0 | 45.216 |
| 1874.0 | 45.904 |
| 1875.0 | 46.823 |
| 1876.0 | 47.578 |
| 1877.0 | 48.234 |
| 1878.0 | 48.076 |
| 1879.0 | 47.117 |
| 1880.0 | 46.206 |
| 1881.0 | 45.928 |
| 1882.0 | 46.47 |
| 1883.0 | 47.442 |
| 1884.0 | 48.017 |
| 1885.0 | 47.87 |
| 1886.0 | 47.064 |
| 1887.0 | 45.761 |
| 1888.0 | 44.718 |
| 1889.0 | 44.654 |
| 1890.0 | 46.058 |
| 1891.0 | 48.328 |
| 1892.0 | 50.025 |
| 1893.0 | 50.331 |
| 1894.0 | 48.765 |
| 1895.0 | 46.406 |
| 1896.0 | 44.654 |
| 1897.0 | 44.121 |
| 1898.0 | 45.186 |
| 1899.0 | 46.313 |
| 1900.0 | 46.8 |
| 1901.0 | 46.402 |
| 1902.0 | 45.234 |
| 1903.0 | 45.269 |
| 1904.0 | 46.625 |
| 1905.0 | 49.214 |
| 1906.0 | 51.559 |
| 1907.0 | 51.809 |
| 1908.0 | 50.084 |
| 1909.0 | 47.192 |
| 1910.0 | 45.09 |
| 1911.0 | 45.055 |
| 1912.0 | 46.8 |
| 1913.0 | 48.859 |
| 1914.0 | 49.815 |
| 1915.0 | 48.825 |
| 1916.0 | 46.503 |
| 1917.0 | 44.102 |
| 1918.0 | 43.096 |
| 1919.0 | 43.987 |
| 1920.0 | 46.029 |
| 1921.0 | 47.886 |
| 1922.0 | 48.582 |
| 1923.0 | 48.01 |
| 1924.0 | 46.947 |
| 1925.0 | 46.318 |
| 1926.0 | 46.44 |
| 1927.0 | 47.098 |
| 1928.0 | 47.674 |
| 1929.0 | 47.829 |
| 1930.0 | 47.61 |
| 1931.0 | 47.279 |
| 1932.0 | 47.092 |
| 1933.0 | 47.172 |
| 1934.0 | 47.227 |
| 1935.0 | 47.154 |
| 1936.0 | 47.068 |
| 1937.0 | 47.192 |
| 1938.0 | 47.795 |
| 1939.0 | 48.53 |
| 1940.0 | 48.962 |
| 1941.0 | 48.836 |
| 1942.0 | 48.182 |
| 1943.0 | 47.649 |
| 1944.0 | 47.6 |
| 1945.0 | 47.957 |
| 1946.0 | 48.348 |
| 1947.0 | 48.404 |
| 1948.0 | 48.245 |
| 1949.0 | 47.982 |
| 1950.0 | 47.766 |
| 1951.0 | 47.712 |
| 1952.0 | 47.798 |
| 1953.0 | 47.895 |
| 1954.0 | 47.886 |
| 1955.0 | 47.811 |
| 1956.0 | 47.823 |
| 1957.0 | 48.052 |
| 1958.0 | 48.473 |
| 1959.0 | 48.769 |
| 1960.0 | 48.736 |
| 1961.0 | 48.435 |
| 1962.0 | 48.228 |
| 1963.0 | 48.176 |
| 1964.0 | 48.253 |
| 1965.0 | 48.362 |
| 1966.0 | 48.414 |
| 1967.0 | 48.434 |
| 1968.0 | 48.308 |
| 1969.0 | 48.226 |
| 1970.0 | 48.355 |
| 1971.0 | 48.704 |
| 1972.0 | 49.152 |
| 1973.0 | 49.343 |
| 1974.0 | 49.248 |
| 1975.0 | 49.032 |
| 1976.0 | 48.846 |
| 1977.0 | 48.843 |
| 1978.0 | 48.83 |
| 1979.0 | 48.797 |
| 1980.0 | 48.727 |
| 1981.0 | 48.676 |
| 1982.0 | 48.69 |
| 1983.0 | 48.718 |
| 1984.0 | 48.8 |
| 1985.0 | 48.907 |
| 1986.0 | 49.084 |
| 1987.0 | 49.338 |
| 1988.0 | 49.626 |
| 1989.0 | 49.769 |
| 1990.0 | 49.59 |
| 1991.0 | 49.091 |
| 1992.0 | 48.519 |
| 1993.0 | 48.249 |
| 1994.0 | 48.449 |
| 1995.0 | 49.037 |
| 1996.0 | 49.557 |
| 1997.0 | 49.675 |
| 1998.0 | 49.443 |
| 1999.0 | 49.166 |
| 2000.065834 | 48.691 |
| 2009.942668 | 48.396 |
| 2020.098566 | 48.18 |
| 2029.969298 | 48.438 |
| 2039.837 | 48.66 |
| 2049.98346 | 48.927 |
| 2059.844971 | 49.196 |
| 2069.985031 | 49.548 |
| 2079.840289 | 49.849 |
| 2089.973887 | 50.114 |
| 2099.822832 | 50.359 |
| 2109.949906 | 50.725 |
| 2119.792477 | 51.083 |
| 2129.912964 | 51.425 |
| 2140.030088 | 51.637 |
| 2149.862941 | 51.829 |
| 2159.973384 | 51.969 |
| 2169.799712 | 52.096 |
| 2179.903413 | 52.26 |
| 2190.003671 | 52.429 |
| 2199.820052 | 52.633 |
| 2209.913475 | 52.809 |
| 2219.723179 | 53.041 |
| 2229.809704 | 53.262 |
| 2239.892708 | 53.495 |
| 2249.692237 | 53.67 |
| 2259.76825 | 53.904 |
| 2269.840694 | 54.148 |
| 2279.909553 | 54.421 |
| 2289.695271 | 54.628 |
| 2299.757015 | 54.82 |
| 2309.815127 | 55.058 |
| 2319.869592 | 55.302 |
| 2329.641254 | 55.522 |
| 2339.688478 | 55.649 |
| 2349.732008 | 55.807 |
| 2359.771828 | 56.031 |
| 2369.80792 | 56.292 |
| 2379.840271 | 56.518 |
| 2389.590342 | 56.634 |
| 2399.615266 | 56.711 |
| 2409.6364 | 56.718 |
| 2419.65373 | 56.712 |
| 2429.667238 | 56.717 |
| 2439.676909 | 56.802 |
| 2449.682728 | 56.987 |
| 2459.684679 | 57.177 |
| 2469.682745 | 57.351 |
| 2479.676911 | 57.474 |
| 2489.667162 | 57.612 |
| 2499.653481 | 57.714 |
| 2509.635853 | 57.794 |
| 2519.614261 | 57.84 |
| 2529.588691 | 57.932 |
| 2539.559127 | 58.051 |
| 2549.525552 | 58.145 |
| 2559.487951 | 58.216 |
| 2569.722871 | 58.326 |
| 2579.677058 | 58.507 |
| 2589.627171 | 58.566 |
| 2599.573195 | 58.468 |
| 2609.515113 | 58.337 |
| 2619.452911 | 58.393 |
| 2629.662448 | 58.545 |
| 2639.591842 | 58.64 |
| 2649.517067 | 58.665 |
| 2659.438109 | 58.717 |
| 2669.630358 | 58.757 |
| 2679.542867 | 58.71 |
| 2689.451145 | 58.403 |
| 2699.630227 | 57.935 |
| 2709.529877 | 57.028 |
| 2719.425248 | 55.446 |
| 2729.591015 | 52.432 |
| 2739.477662 | 47.778 |
| 2749.359982 | 41.682 |
| 2759.512287 | 35.197 |
| 2769.385788 | 29.15 |
| 2779.528995 | 24.257 |
| 2789.393611 | 20.506 |
| 2799.527654 | 17.903 |
| 2809.383323 | 16.14 |
| 2819.508136 | 15.02 |
| 2829.354792 | 14.363 |
| 2839.47031 | 13.959 |
| 2849.30789 | 13.753 |
| 2859.414046 | 13.575 |
| 2869.515434 | 13.503 |
| 2879.339216 | 13.559 |
| 2889.431143 | 13.79 |
| 2899.24569 | 14.109 |
| 2909.328092 | 14.392 |
| 2919.40564 | 14.67 |
| 2929.206149 | 14.988 |
| 2939.274073 | 15.436 |
| 2949.337095 | 15.877 |
| 2959.395197 | 16.238 |
| 2969.17672 | 16.575 |
| 2979.225066 | 16.99 |
| 2989.268442 | 17.489 |
| 2999.306833 | 17.945 |
| 3009.34022 | 18.357 |
| 3019.368587 | 18.809 |
| 3029.391918 | 19.226 |
| 3039.139497 | 19.655 |
| 3049.152842 | 19.989 |
| 3059.1611 | 20.395 |
| 3069.164256 | 20.772 |
| 3079.162292 | 21.185 |
| 3089.155191 | 21.651 |
| 3099.142938 | 22.204 |
| 3109.125515 | 22.774 |
| 3119.102905 | 23.304 |
| 3129.075093 | 23.746 |
| 3139.311366 | 24.215 |
| 3149.272956 | 24.721 |
| 3159.229293 | 25.274 |
| 3169.18036 | 25.86 |
| 3179.126141 | 26.385 |
| 3189.066618 | 26.969 |
| 3199.27022 | 27.493 |
| 3209.199897 | 28.057 |
| 3219.124221 | 28.487 |
| 3229.043176 | 28.956 |
| 3239.224603 | 29.4 |
| 3249.132622 | 29.91 |
| 3259.035221 | 30.338 |
| 3269.199799 | 30.697 |
| 3279.091361 | 30.981 |
| 3288.977454 | 31.213 |
| 3299.125027 | 31.364 |
| 3308.999981 | 31.36 |
| 3319.136081 | 31.18 |
| 3328.999829 | 30.914 |
| 3339.124385 | 30.643 |
| 3348.976861 | 30.393 |
| 3359.089804 | 29.986 |
| 3368.930939 | 29.482 |
| 3379.0322 | 28.829 |
| 3389.127517 | 28.139 |
| 3398.951437 | 27.273 |
| 3409.034967 | 26.219 |
| 3419.112499 | 25.033 |
| 3428.919052 | 23.721 |
| 3438.984693 | 22.42 |
| 3449.044284 | 21.007 |
| 3458.833318 | 19.607 |
| 3468.880914 | 18.223 |
| 3478.922407 | 17.078 |
| 3488.957779 | 16.012 |
| 3498.987012 | 14.906 |
| 3509.010089 | 13.63 |
| 3519.026992 | 12.445 |
| 3529.037703 | 11.36 |
| 3538.779008 | 10.403 |
| 3548.777448 | 9.404 |
| 3558.769643 | 8.547 |
| 3568.755577 | 7.835 |
| 3578.997769 | 7.287 |
| 3588.970961 | 6.676 |
| 3598.937838 | 6.046 |
| 3608.898383 | 5.408 |
| 3618.852578 | 4.949 |
| 3628.800407 | 4.622 |
| 3638.74185 | 4.48 |
| 3648.938253 | 4.407 |
| 3658.866705 | 4.398 |
| 3668.788719 | 4.352 |
| 3678.704279 | 4.327 |
| 3688.874043 | 4.325 |
| 3698.776469 | 4.534 |
| 3708.672387 | 4.891 |
| 3718.821938 | 5.353 |
| 3728.704616 | 5.682 |
| 3738.840542 | 5.949 |
| 3748.709907 | 6.282 |
| 3758.832135 | 6.742 |
| 3768.688117 | 7.328 |
| 3778.796573 | 7.81 |
| 3788.639101 | 8.34 |
| 3798.733711 | 8.892 |
| 3808.821282 | 9.648 |
| 3818.643407 | 10.328 |
| 3828.717023 | 10.851 |
| 3838.783543 | 11.207 |
| 3848.585104 | 11.398 |
| 3858.637559 | 11.533 |
| 3868.682864 | 11.449 |
| 3878.720999 | 11.434 |
| 3888.751945 | 11.239 |
| 3898.518755 | 11.031 |
| 3908.535455 | 10.569 |
| 3918.54491 | 10.178 |
| 3928.547104 | 9.832 |
| 3938.542016 | 9.54 |
| 3948.52963 | 9.224 |
| 3958.509925 | 8.769 |
| 3968.482884 | 8.52 |
| 3978.70392 | 8.237 |
| 3988.661962 | 8.041 |
| 3998.612612 | 7.622 |
| 4008.555852 | 7.298 |
| 4018.491662 | 7.078 |
| 4028.6745 | 6.962 |
| 4038.595205 | 6.849 |
| 4048.508426 | 6.854 |
| 4058.414143 | 6.903 |
| 4068.56604 | 7.089 |
| 4078.456503 | 7.096 |
| 4088.592715 | 7.185 |
| 4098.467848 | 7.137 |
| 4108.588299 | 7.24 |
| 4118.448027 | 7.302 |
| 4128.552639 | 7.386 |
| 4138.396887 | 7.321 |
| 4148.485584 | 7.277 |
| 4158.566193 | 7.356 |
| 4168.386981 | 7.573 |
| 4178.45156 | 7.697 |
| 4188.507992 | 7.688 |
| 4198.305151 | 7.659 |
| 4208.345437 | 7.767 |
| 4218.377519 | 7.794 |
| 4228.401377 | 7.67 |
| 4238.416991 | 7.399 |
| 4248.424343 | 7.361 |
| 4258.423411 | 7.13 |
| 4268.414178 | 6.733 |
| 4278.396623 | 5.854 |
| 4288.370728 | 5.226 |
| 4298.336471 | 4.623 |
| 4308.293836 | 4.258 |
| 4318.2428 | 4.049 |
| 4328.431752 | 4.196 |
| 4338.363649 | 4.535 |
| 4348.287088 | 4.749 |
| 4358.20205 | 4.771 |
| 4368.356068 | 4.684 |
| 4378.253805 | 4.407 |
| 4388.390126 | 4.003 |
| 4398.270558 | 3.568 |
| 4408.389101 | 3.259 |
| 4418.252149 | 3.031 |
| 4428.352834 | 2.779 |
| 4438.198419 | 2.58 |
| 4448.281165 | 2.342 |
| 4458.354799 | 2.134 |
| 4468.173935 | 1.858 |
| 4478.229508 | 1.702 |
| 4488.275909 | 1.542 |
| 4498.313117 | 1.582 |
| 4508.096635 | 1.588 |
| 4518.115621 | 1.588 |
| 4528.125352 | 1.626 |
| 4538.125809 | 1.553 |
| 4548.11697 | 1.454 |
| 4558.098816 | 1.33 |
| 4568.071325 | 1.239 |
| 4578.277365 | 1.153 |
| 4588.230912 | 1.074 |
| 4598.175061 | 0.99 |
| 4608.109792 | 0.923 |
| 4618.035085 | 0.871 |
| 4628.192649 | 0.834 |
| 4638.098772 | 0.803 |
| 4647.995395 | 0.776 |
| 4658.123528 | 0.752 |
| 4668.000857 | 0.723 |
| 4678.109183 | 0.691 |
| 4687.967136 | 0.659 |
| 4698.05557 | 0.633 |
| 4708.133906 | 0.614 |
| 4717.962521 | 0.595 |
| 4728.020838 | 0.577 |
| 4738.068993 | 0.56 |
| 4748.106964 | 0.547 |
| 4758.13473 | 0.534 |
| 4767.913874 | 0.521 |
| 4777.921408 | 0.505 |
| 4787.918673 | 0.491 |
| 4797.905646 | 0.477 |
| 4807.882307 | 0.463 |
| 4818.085802 | 0.45 |
| 4828.041526 | 0.441 |
| 4837.986874 | 0.433 |
| 4847.921823 | 0.425 |
| 4857.846351 | 0.415 |
| 4867.996361 | 0.405 |
| 4877.899737 | 0.395 |
| 4888.028045 | 0.387 |
| 4897.910179 | 0.379 |
| 4908.016697 | 0.372 |
| 4917.877504 | 0.366 |
| 4927.962141 | 0.36 |
| 4937.801534 | 0.358 |
| 4947.864203 | 0.357 |
| 4957.915724 | 0.357 |
| 4967.956075 | 0.354 |
| 4977.985234 | 0.349 |
| 4987.77033 | 0.345 |
| 4997.777298 | 0.34 |
| 5007.776688 | 0.336 |
| 5017.595804 | 0.334 |
| 5028.169082 | 0.331 |
| 5037.98605 | 0.327 |
| 5047.80198 | 0.324 |
| 5057.616872 | 0.321 |
| 5068.18559 | 0.319 |
| 5077.998316 | 0.316 |
| 5087.809996 | 0.313 |
| 5097.620628 | 0.31 |
| 5107.430211 | 0.307 |
| 5117.993201 | 0.304 |
| 5127.800597 | 0.299 |
| 5137.606938 | 0.296 |
| 5147.41222 | 0.293 |
| 5157.970569 | 0.29 |
| 5167.773648 | 0.287 |
| 5177.575662 | 0.283 |
| 5187.376611 | 0.28 |
| 5197.930283 | 0.277 |
| 5207.729011 | 0.275 |
| 5217.526666 | 0.273 |
| 5227.323247 | 0.272 |
| 5237.872207 | 0.271 |
| 5247.666549 | 0.27 |
| 5257.459812 | 0.269 |
| 5268.005191 | 0.267 |
| 5277.796202 | 0.264 |
| 5287.586127 | 0.262 |
| 5297.374963 | 0.261 |
| 5307.915566 | 0.26 |
| 5317.702134 | 0.259 |
| 5327.487607 | 0.257 |
| 5337.271982 | 0.256 |
| 5347.807773 | 0.255 |
| 5357.589864 | 0.253 |
| 5367.370852 | 0.251 |
| 5377.902987 | 0.249 |
| 5387.681677 | 0.248 |
| 5397.459258 | 0.247 |
| 5407.235727 | 0.246 |
| 5417.762987 | 0.244 |
| 5427.537141 | 0.242 |
| 5437.310177 | 0.242 |
| 5447.833734 | 0.242 |
| 5457.604442 | 0.241 |
| 5467.374028 | 0.24 |
| 5477.142487 | 0.24 |
| 5487.661104 | 0.239 |
| 5497.427219 | 0.238 |
| 5507.192201 | 0.237 |
| 5517.707068 | 0.235 |
| 5527.469693 | 0.233 |
| 5537.231179 | 0.232 |
| 5547.742274 | 0.231 |
| 5557.50139 | 0.231 |
| 5567.259362 | 0.231 |
| 5577.766665 | 0.231 |
| 5587.522253 | 0.232 |
| 5597.276691 | 0.231 |
| 5607.780182 | 0.231 |
| 5617.532223 | 0.231 |
| 5627.283108 | 0.234 |
| 5637.032835 | 0.236 |
| 5647.531242 | 0.237 |
| 5657.278555 | 0.237 |
| 5667.024703 | 0.237 |
| 5677.51925 | 0.236 |
| 5687.262972 | 0.235 |
| 5697.005523 | 0.234 |
| 5707.496189 | 0.232 |
| 5717.236302 | 0.231 |
| 5726.975237 | 0.231 |
| 5737.462002 | 0.233 |
| 5747.198485 | 0.237 |
| 5757.682605 | 0.24 |
| 5767.416629 | 0.241 |
| 5777.149464 | 0.241 |
| 5787.629649 | 0.241 |
| 5797.360012 | 0.24 |
| 5807.08918 | 0.239 |
| 5817.565409 | 0.238 |
| 5827.292092 | 0.238 |
| 5837.017575 | 0.238 |
| 5847.489828 | 0.237 |
| 5857.212813 | 0.237 |
| 5866.934591 | 0.236 |
| 5877.402847 | 0.235 |
| 5887.122114 | 0.236 |
| 5897.587661 | 0.238 |
| 5907.304408 | 0.24 |
| 5917.019938 | 0.24 |
| 5927.481454 | 0.24 |
| 5937.194452 | 0.239 |
| 5946.906226 | 0.239 |
| 5957.363691 | 0.239 |
| 5967.072921 | 0.239 |
| 5977.52764 | 0.238 |
| 5987.234315 | 0.237 |
| 5996.939757 | 0.237 |
| 6007.39039 | 0.238 |
| 6017.093265 | 0.238 |
| 6026.794901 | 0.238 |
| 6037.241429 | 0.238 |
| 6046.940485 | 0.24 |
| 6057.38423 | 0.243 |
| 6067.080698 | 0.244 |
| 6076.775917 | 0.245 |
| 6087.215522 | 0.244 |
| 6096.908139 | 0.243 |
| 6107.344938 | 0.243 |
| 6117.034946 | 0.242 |
| 6126.723694 | 0.241 |
| 6137.156319 | 0.241 |
| 6146.842444 | 0.241 |
| 6157.272241 | 0.241 |
| 6166.955735 | 0.24 |
| 6177.382693 | 0.239 |
| 6187.063548 | 0.238 |
| 6196.743128 | 0.237 |
| 6207.165865 | 0.236 |
| 6216.842793 | 0.235 |
| 6227.262668 | 0.235 |
| 6236.936935 | 0.235 |
| 6246.609918 | 0.236 |
| 6257.025537 | 0.238 |
| 6266.695846 | 0.24 |
| 6277.108582 | 0.243 |
| 6286.776208 | 0.244 |
| 6297.18605 | 0.244 |
| 6306.850986 | 0.244 |
| 6317.257926 | 0.244 |
| 6326.920162 | 0.244 |
| 6336.581095 | 0.245 |
| 6346.983717 | 0.244 |
| 6356.641938 | 0.244 |
| 6367.041635 | 0.243 |
| 6376.697135 | 0.242 |
| 6387.093897 | 0.241 |
| 6396.746668 | 0.24 |
| 6407.140486 | 0.24 |
| 6416.790518 | 0.239 |
| 6427.181383 | 0.239 |
| 6436.828669 | 0.241 |
| 6446.47463 | 0.244 |
| 6456.861103 | 0.247 |
| 6466.504304 | 0.248 |
| 6476.8878 | 0.248 |
| 6486.528234 | 0.248 |
| 6496.908745 | 0.247 |
| 6506.546402 | 0.247 |
| 6516.923919 | 0.248 |
| 6526.558791 | 0.249 |
| 6536.933304 | 0.25 |
| 6546.565382 | 0.25 |
| 6556.936882 | 0.25 |
| 6566.566159 | 0.249 |
| 6576.934637 | 0.249 |
| 6586.561102 | 0.248 |
| 6596.926549 | 0.248 |
| 6606.550195 | 0.248 |
| 6616.912601 | 0.248 |
| 6626.53342 | 0.248 |
| 6636.892776 | 0.248 |
| 6646.510758 | 0.248 |
| 6656.867055 | 0.248 |
| 6666.482193 | 0.248 |
| 6676.835422 | 0.248 |
| 6686.447706 | 0.247 |
| 6696.797857 | 0.247 |
| 6706.40728 | 0.248 |
| 6716.754344 | 0.248 |
| 6726.360896 | 0.249 |
| 6736.704865 | 0.248 |
| 6746.308538 | 0.249 |
| 6756.649402 | 0.249 |
| 6766.250188 | 0.25 |
| 6776.587937 | 0.25 |
| 6786.924068 | 0.249 |
| 6796.520453 | 0.248 |
| 6806.853456 | 0.247 |
| 6816.446931 | 0.247 |
| 6826.776797 | 0.247 |
| 6836.367355 | 0.247 |
| 6846.694074 | 0.248 |
| 6856.281707 | 0.248 |
| 6866.60527 | 0.248 |
| 6876.189968 | 0.247 |
| 6886.510366 | 0.247 |
| 6896.82912 | 0.247 |
| 6906.409345 | 0.247 |
| 6916.724921 | 0.247 |
| 6926.30219 | 0.247 |
| 6936.614577 | 0.247 |
| 6946.188882 | 0.246 |
| 6956.498072 | 0.246 |
| 6966.805601 | 0.245 |
| 6976.375388 | 0.245 |
| 6986.679706 | 0.244 |
| 6996.246507 | 0.243 |
| 7006.547605 | 0.243 |
| 7016.111412 | 0.243 |
| 7026.40928 | 0.243 |
| 7036.70547 | 0.243 |
| 7046.264714 | 0.242 |
| 7056.557661 | 0.241 |
| 7066.113889 | 0.241 |
| 7076.403584 | 0.242 |
| 7086.691589 | 0.242 |
| 7096.243221 | 0.241 |
| 7106.527959 | 0.241 |
| 7116.076554 | 0.24 |
| 7126.358018 | 0.24 |
| 7136.637779 | 0.24 |
| 7146.181746 | 0.24 |
| 7156.458218 | 0.24 |
| 7165.999126 | 0.24 |
| 7176.2723 | 0.24 |
| 7186.54376 | 0.24 |
| 7196.080008 | 0.24 |
| 7206.348156 | 0.239 |
| 7216.614582 | 0.239 |
| 7226.14615 | 0.238 |
| 7236.409251 | 0.238 |
| 7245.937725 | 0.238 |
| 7256.197491 | 0.238 |
| 7266.455524 | 0.238 |
| 7275.979286 | 0.238 |
| 7286.23397 | 0.238 |
| 7296.486914 | 0.238 |
| 7306.005944 | 0.237 |
| 7316.255525 | 0.237 |
| 7326.503358 | 0.236 |
| 7336.017637 | 0.236 |
| 7346.262094 | 0.235 |
| 7356.504797 | 0.235 |
| 7366.014304 | 0.235 |
| 7376.253616 | 0.235 |
| 7386.491167 | 0.235 |
| 7395.995884 | 0.235 |
| 7406.23003 | 0.234 |
| 7416.462408 | 0.234 |
| 7425.962315 | 0.234 |
| 7436.191274 | 0.234 |
| 7446.418458 | 0.233 |
| 7455.913536 | 0.233 |
| 7466.137287 | 0.232 |
| 7476.359256 | 0.232 |
| 7485.849485 | 0.232 |
| 7496.068008 | 0.232 |
| 7506.284741 | 0.232 |
| 7515.770101 | 0.233 |
| 7525.983375 | 0.233 |
| 7536.19485 | 0.233 |
| 7545.675324 | 0.233 |
| 7555.883326 | 0.234 |
| 7566.089524 | 0.234 |
| 7576.293916 | 0.233 |
| 7585.767802 | 0.233 |
| 7595.968701 | 0.233 |
| 7606.167786 | 0.233 |
| 7615.636739 | 0.232 |
| 7625.832319 | 0.232 |
| 7636.026078 | 0.232 |
| 7646.218013 | 0.231 |
| 7655.680318 | 0.231 |
| 7665.868729 | 0.231 |
| 7676.05531 | 0.232 |
| 7686.240057 | 0.232 |
| 7695.695679 | 0.231 |
| 7705.876884 | 0.231 |
| 7716.056248 | 0.23 |
| 7726.23377 | 0.23 |
| 7735.682674 | 0.229 |
| 7745.856636 | 0.229 |
| 7756.028747 | 0.229 |
| 7766.199006 | 0.229 |
| 7775.641157 | 0.229 |
| 7785.807837 | 0.229 |
| 7795.972657 | 0.229 |
| 7806.135616 | 0.228 |
| 7815.57098 | 0.228 |
| 7825.730341 | 0.228 |
| 7835.887833 | 0.228 |
| 7846.043454 | 0.228 |
| 7855.471995 | 0.227 |
| 7865.624 | 0.227 |
| 7875.774127 | 0.226 |
| 7885.922372 | 0.226 |
| 7896.068734 | 0.225 |
| 7905.488668 | 0.225 |
| 7915.631391 | 0.225 |
| 7925.772224 | 0.225 |
| 7935.911164 | 0.224 |
| 7946.048209 | 0.224 |
| 7955.45948 | 0.224 |
| 7965.592863 | 0.224 |
| 7975.724343 | 0.224 |
| 7985.853919 | 0.224 |
| 7995.981587 | 0.224 |
| 8005.384141 | 0.223 |
| 8015.508125 | 0.223 |
| 8025.630194 | 0.223 |
| 8035.750346 | 0.223 |
| 8045.86858 | 0.224 |
| 8055.984892 | 0.225 |
| 8065.376887 | 0.225 |
| 8075.489487 | 0.226 |
| 8085.600158 | 0.226 |
| 8095.708897 | 0.227 |
| 8105.815704 | 0.227 |
| 8115.920574 | 0.228 |
| 8125.301933 | 0.228 |
| 8135.403063 | 0.227 |
| 8145.502251 | 0.227 |
| 8155.599493 | 0.227 |
| 8165.694787 | 0.227 |
| 8175.788131 | 0.228 |
| 8185.879523 | 0.228 |
| 8195.248351 | 0.228 |
| 8205.33597 | 0.228 |
| 8215.42163 | 0.228 |
| 8225.505327 | 0.228 |
| 8235.587061 | 0.228 |
| 8245.666827 | 0.228 |
| 8255.744624 | 0.228 |
| 8265.82045 | 0.227 |
| 8275.174806 | 0.227 |
| 8285.246822 | 0.227 |
| 8295.31686 | 0.226 |
| 8305.384917 | 0.226 |
| 8315.45099 | 0.226 |
| 8325.515077 | 0.226 |
| 8335.577176 | 0.225 |
| 8345.637284 | 0.225 |
| 8355.695399 | 0.225 |
| 8365.751519 | 0.225 |
| 8375.087555 | 0.225 |
| 8385.139819 | 0.225 |
| 8395.190081 | 0.225 |
| 8405.238338 | 0.225 |
| 8415.284587 | 0.225 |
| 8425.328827 | 0.224 |
| 8435.371055 | 0.224 |
| 8445.411268 | 0.224 |
| 8455.449464 | 0.225 |
| 8465.485641 | 0.225 |
| 8475.519796 | 0.225 |
| 8485.551927 | 0.225 |
| 8495.582031 | 0.225 |
| 8505.610107 | 0.224 |
| 8515.636151 | 0.224 |
| 8525.660162 | 0.224 |
| 8535.682136 | 0.224 |
| 8544.98643 | 0.225 |
| 8555.004471 | 0.225 |
| 8565.020468 | 0.225 |
| 8575.034421 | 0.226 |
| 8585.046325 | 0.227 |
| 8595.056179 | 0.227 |
| 8605.063981 | 0.226 |
| 8615.069727 | 0.226 |
| 8625.073416 | 0.226 |
| 8635.075045 | 0.225 |
| 8645.074612 | 0.225 |
| 8655.072114 | 0.224 |
| 8665.067549 | 0.224 |
| 8675.060915 | 0.224 |
| 8685.052209 | 0.223 |
| 8695.041429 | 0.223 |
| 8705.028573 | 0.223 |
| 8715.013637 | 0.222 |
| 8724.99662 | 0.222 |
| 8734.977519 | 0.222 |
| 8744.956333 | 0.222 |
| 8754.933058 | 0.222 |
| 8764.907692 | 0.222 |
| 8774.880232 | 0.222 |
| 8784.850677 | 0.222 |
| 8794.819025 | 0.222 |
| 8804.785271 | 0.222 |
| 8815.461059 | 0.221 |
| 8825.422948 | 0.221 |
| 8835.382728 | 0.221 |
| 8845.340399 | 0.221 |
| 8855.295957 | 0.221 |
| 8865.249401 | 0.221 |
| 8875.200727 | 0.221 |
| 8885.149933 | 0.221 |
| 8895.097018 | 0.221 |
| 8905.041978 | 0.221 |
| 8914.984812 | 0.221 |
| 8924.925517 | 0.22 |
| 8934.86409 | 0.22 |
| 8944.800529 | 0.22 |
| 8954.734832 | 0.22 |
| 8965.376355 | 0.22 |
| 8975.306225 | 0.22 |
| 8985.233952 | 0.22 |
| 8995.159534 | 0.219 |
| 9005.082967 | 0.219 |
| 9015.004249 | 0.219 |
| 9024.923378 | 0.219 |
| 9034.840353 | 0.219 |
| 9044.755169 | 0.219 |
| 9054.667825 | 0.219 |
| 9065.286129 | 0.219 |
| 9075.194303 | 0.218 |
| 9085.10031 | 0.218 |
| 9095.004147 | 0.218 |
| 9104.905813 | 0.217 |
| 9114.805303 | 0.217 |
| 9124.702617 | 0.217 |
| 9134.597752 | 0.216 |
| 9145.197262 | 0.216 |
| 9155.087875 | 0.216 |
| 9164.976302 | 0.216 |
| 9174.86254 | 0.216 |
| 9184.746587 | 0.217 |
| 9194.628441 | 0.217 |
| 9204.508098 | 0.217 |
| 9215.091006 | 0.217 |
| 9224.966108 | 0.217 |
| 9234.839006 | 0.217 |
| 9244.709699 | 0.217 |
| 9254.578185 | 0.217 |
| 9265.149109 | 0.217 |
| 9275.013013 | 0.216 |
| 9284.874702 | 0.216 |
| 9294.734174 | 0.216 |
| 9304.591426 | 0.215 |
| 9314.446456 | 0.215 |
| 9325.002949 | 0.215 |
| 9334.853368 | 0.216 |
| 9344.701558 | 0.216 |
| 9354.547517 | 0.216 |
| 9364.391241 | 0.216 |
| 9374.935607 | 0.215 |
| 9384.774696 | 0.215 |
| 9394.611544 | 0.215 |
| 9404.446148 | 0.214 |
| 9414.980732 | 0.214 |
| 9424.810682 | 0.214 |
| 9434.63838 | 0.214 |
| 9444.463825 | 0.214 |
| 9454.988585 | 0.214 |
| 9464.809356 | 0.214 |
| 9474.627866 | 0.214 |
| 9484.444114 | 0.214 |
| 9494.959008 | 0.213 |
| 9504.770561 | 0.213 |
| 9514.579844 | 0.213 |
| 9524.386855 | 0.213 |
| 9534.891842 | 0.213 |
| 9544.694139 | 0.213 |
| 9554.494156 | 0.213 |
| 9564.291891 | 0.213 |
| 9574.786929 | 0.213 |
| 9584.57993 | 0.213 |
| 9594.370643 | 0.213 |
| 9604.858149 | 0.212 |
| 9614.644112 | 0.212 |
| 9624.427779 | 0.212 |
| 9634.209147 | 0.212 |
| 9644.686632 | 0.211 |
| 9654.463232 | 0.211 |
| 9664.237526 | 0.211 |
| 9674.707423 | 0.211 |
| 9684.476934 | 0.211 |
| 9694.244132 | 0.21 |
| 9704.706417 | 0.21 |
| 9714.468817 | 0.21 |
| 9724.228897 | 0.21 |
| 9734.683548 | 0.21 |
| 9744.438814 | 0.21 |
| 9754.191753 | 0.21 |
| 9764.638746 | 0.21 |
| 9774.386857 | 0.21 |
| 9784.132634 | 0.21 |
| 9794.571945 | 0.21 |
| 9804.312879 | 0.21 |
| 9814.746996 | 0.21 |
| 9824.483078 | 0.21 |
| 9834.216813 | 0.21 |
| 9844.643209 | 0.209 |
| 9854.372076 | 0.209 |
| 9864.09859 | 0.209 |
| 9874.517241 | 0.209 |
| 9884.238873 | 0.209 |
| 9894.652288 | 0.209 |
| 9904.369027 | 0.209 |
| 9914.083402 | 0.209 |
| 9924.489032 | 0.209 |
| 9934.198499 | 0.209 |
| 9944.598867 | 0.209 |
| 9954.303417 | 0.209 |
| 9964.00559 | 0.209 |
| 9974.398135 | 0.209 |
| 9984.095376 | 0.209 |
| 9994.482631 | 0.209 |
| 10004.17493 | 0.209 |
| 10014.55689 | 0.209 |
| 10024.24423 | 0.209 |
| 10033.92919 | 0.209 |
| 10044.30326 | 0.209 |
| 10053.98325 | 0.209 |
| 10064.352 | 0.209 |
| 10074.02701 | 0.209 |
| 10084.39043 | 0.209 |
| 10094.06045 | 0.209 |
| 10104.41852 | 0.209 |
| 10114.08355 | 0.21 |
| 10124.43625 | 0.21 |
| 10134.09628 | 0.21 |
| 10144.44362 | 0.21 |
| 10154.09862 | 0.21 |
| 10164.44058 | 0.21 |
| 10174.09056 | 0.21 |
| 10184.42713 | 0.21 |
| 10194.07208 | 0.21 |
| 10204.40325 | 0.211 |
| 10214.04315 | 0.211 |
| 10224.36891 | 0.211 |
| 10234.00375 | 0.21 |
| 10244.32409 | 0.211 |
| 10253.95386 | 0.211 |
| 10264.26877 | 0.211 |
| 10273.89347 | 0.21 |
| 10284.20293 | 0.21 |
| 10293.82255 | 0.21 |
| 10304.12656 | 0.21 |
| 10313.74108 | 0.21 |
| 10324.03963 | 0.21 |
| 10334.33534 | 0.21 |
| 10343.94211 | 0.21 |
| 10354.23234 | 0.21 |
| 10363.834 | 0.211 |
| 10374.11874 | 0.21 |
| 10383.71527 | 0.21 |
| 10393.99451 | 0.21 |
| 10404.2709 | 0.21 |
| 10413.85962 | 0.21 |
| 10424.1305 | 0.21 |
| 10433.71407 | 0.209 |
| 10443.97941 | 0.209 |
| 10454.2419 | 0.209 |
| 10463.81763 | 0.209 |
| 10474.07457 | 0.209 |
| 10483.64512 | 0.209 |
| 10493.8965 | 0.209 |
| 10504.14501 | 0.21 |
| 10513.70769 | 0.21 |
| 10523.95063 | 0.21 |
| 10534.19068 | 0.21 |
| 10543.74545 | 0.21 |
| 10553.97992 | 0.21 |
| 10564.21149 | 0.21 |
| 10573.75835 | 0.21 |
| 10583.98432 | 0.21 |
| 10593.52594 | 0.21 |
| 10603.7463 | 0.21 |
| 10613.96375 | 0.21 |
| 10624.17829 | 0.21 |
| 10633.70924 | 0.21 |
| 10643.91815 | 0.21 |
| 10654.12414 | 0.21 |
| 10663.64709 | 0.21 |
| 10673.84743 | 0.209 |
| 10684.04485 | 0.209 |
| 10693.55979 | 0.209 |
| 10703.75154 | 0.209 |
| 10713.94035 | 0.209 |
| 10723.44726 | 0.209 |
| 10733.6304 | 0.209 |
| 10743.81059 | 0.209 |
| 10753.98783 | 0.208 |
| 10763.48393 | 0.208 |
| 10773.65548 | 0.208 |
| 10783.82407 | 0.208 |
| 10793.9897 | 0.208 |
| 10803.47495 | 0.208 |
| 10813.63486 | 0.208 |
| 10823.7918 | 0.208 |
| 10833.94578 | 0.208 |
| 10843.42014 | 0.208 |
| 10853.56838 | 0.208 |
| 10863.71363 | 0.209 |
| 10873.85591 | 0.209 |
| 10883.31935 | 0.209 |
| 10893.45586 | 0.208 |
| 10903.58938 | 0.208 |
| 10913.71992 | 0.208 |
| 10923.84746 | 0.208 |
| 10933.29714 | 0.208 |
| 10943.41889 | 0.207 |
| 10953.53764 | 0.208 |
| 10963.65339 | 0.208 |
| 10973.76613 | 0.208 |
| 10983.87586 | 0.207 |
| 10993.3089 | 0.207 |
| 11003.41281 | 0.207 |
| 11013.5137 | 0.207 |
| 11023.61157 | 0.207 |
| 11033.70642 | 0.207 |
| 11043.79825 | 0.208 |
| 11053.21456 | 0.209 |
| 11063.30053 | 0.209 |
| 11073.38346 | 0.21 |
| 11083.46337 | 0.21 |
| 11093.54023 | 0.209 |
| 11103.61405 | 0.209 |
| 11113.68483 | 0.209 |
| 11123.75256 | 0.209 |
| 11133.14635 | 0.209 |
| 11143.20819 | 0.209 |
| 11153.26696 | 0.209 |
| 11163.32268 | 0.209 |
| 11173.37534 | 0.208 |
| 11183.42494 | 0.208 |
| 11193.47147 | 0.208 |
| 11203.51493 | 0.208 |
| 11213.55532 | 0.208 |
| 11223.59263 | 0.208 |
| 11233.62687 | 0.208 |
| 11243.65803 | 0.208 |
| 11253.6861 | 0.209 |
| 11263.71109 | 0.209 |
| 11273.06496 | 0.21 |
| 11283.08398 | 0.21 |
| 11293.09991 | 0.211 |
| 11303.11274 | 0.211 |
| 11313.12247 | 0.211 |
| 11323.12909 | 0.211 |
| 11333.13262 | 0.211 |
| 11343.13303 | 0.211 |
| 11353.13034 | 0.211 |
| 11363.12453 | 0.211 |
| 11373.11561 | 0.211 |
| 11383.10358 | 0.211 |
| 11393.08842 | 0.211 |
| 11403.07013 | 0.211 |
| 11413.04872 | 0.211 |
| 11423.02418 | 0.211 |
| 11432.99651 | 0.211 |
| 11442.96571 | 0.211 |
| 11452.93177 | 0.212 |
| 11463.55877 | 0.212 |
| 11473.51834 | 0.212 |
| 11483.47476 | 0.213 |
| 11493.42803 | 0.213 |
| 11503.37815 | 0.213 |
| 11513.32512 | 0.213 |
| 11523.26893 | 0.213 |
| 11533.20958 | 0.213 |
| 11543.14707 | 0.213 |
| 11553.0814 | 0.213 |
| 11563.01256 | 0.213 |
| 11572.94055 | 0.213 |
| 11582.86536 | 0.213 |
| 11593.44833 | 0.213 |
| 11603.36658 | 0.213 |
| 11613.28165 | 0.213 |
| 11623.19353 | 0.213 |
| 11633.10223 | 0.213 |
| 11643.00774 | 0.214 |
| 11652.91006 | 0.214 |
| 11662.80918 | 0.214 |
| 11673.36472 | 0.214 |
| 11683.25723 | 0.214 |
| 11693.14654 | 0.215 |
| 11703.03264 | 0.215 |
| 11712.91554 | 0.216 |
| 11722.79522 | 0.216 |
| 11733.33001 | 0.216 |
| 11743.20304 | 0.217 |
| 11753.07286 | 0.217 |
| 11762.93946 | 0.217 |
| 11772.80283 | 0.217 |
| 11783.3202 | 0.216 |
| 11793.1769 | 0.216 |
| 11803.03036 | 0.216 |
| 11812.88059 | 0.217 |
| 11822.72758 | 0.217 |
| 11833.22747 | 0.217 |
| 11843.06776 | 0.217 |
| 11852.9048 | 0.218 |
| 11862.73859 | 0.218 |
| 11873.22439 | 0.218 |
| 11883.05145 | 0.218 |
| 11892.87526 | 0.218 |
| 11902.69581 | 0.218 |
| 11913.16747 | 0.218 |
| 11922.98127 | 0.218 |
| 11932.79181 | 0.217 |
| 11942.59907 | 0.217 |
| 11953.05654 | 0.217 |
| 11962.85704 | 0.217 |
| 11972.65425 | 0.217 |
| 11983.10099 | 0.217 |
| 11992.89142 | 0.217 |
| 12002.67856 | 0.217 |
| 12013.11455 | 0.217 |
| 12022.89488 | 0.217 |
| 12032.67192 | 0.217 |
| 12043.09713 | 0.217 |
| 12052.86735 | 0.217 |
| 12062.63426 | 0.217 |
| 12073.04866 | 0.217 |
| 12082.80874 | 0.217 |
| 12092.5655 | 0.217 |
| 12102.96906 | 0.217 |
| 12112.71897 | 0.218 |
| 12122.46556 | 0.218 |
| 12132.85826 | 0.218 |
| 12142.59798 | 0.218 |
| 12152.98334 | 0.218 |
| 12162.71618 | 0.218 |
| 12172.44568 | 0.218 |
| 12182.82013 | 0.218 |
| 12192.54273 | 0.219 |
| 12202.90982 | 0.219 |
| 12212.62551 | 0.219 |
| 12222.98523 | 0.219 |
| 12232.69399 | 0.219 |
| 12242.39941 | 0.219 |
| 12252.74815 | 0.219 |
| 12262.44662 | 0.219 |
| 12272.78796 | 0.219 |
| 12282.47948 | 0.219 |
| 12292.81339 | 0.219 |
| 12302.49796 | 0.219 |
| 12312.82444 | 0.219 |
| 12322.50203 | 0.219 |
| 12332.82106 | 0.22 |
| 12342.49167 | 0.22 |
| 12352.80325 | 0.22 |
| 12362.46686 | 0.22 |
| 12372.77097 | 0.22 |
| 12382.42757 | 0.22 |
| 12392.7242 | 0.22 |
| 12402.37378 | 0.22 |
| 12412.66292 | 0.22 |
| 12422.30547 | 0.22 |
| 12432.58711 | 0.22 |
| 12442.22262 | 0.22 |
| 12452.49673 | 0.221 |
| 12462.76697 | 0.221 |
| 12472.39178 | 0.221 |
| 12482.65448 | 0.22 |
| 12492.27222 | 0.22 |
| 12502.52738 | 0.22 |
| 12512.77863 | 0.221 |
| 12522.38563 | 0.22 |
| 12532.62932 | 0.22 |
| 12542.22922 | 0.22 |
| 12552.46533 | 0.221 |
| 12562.69753 | 0.221 |
| 12572.28665 | 0.221 |
| 12582.51125 | 0.221 |
| 12592.73192 | 0.221 |
| 12602.31024 | 0.221 |
| 12612.5233 | 0.221 |
| 12622.09447 | 0.221 |
| 12632.29991 | 0.221 |
| 12642.5014 | 0.222 |
| 12652.69895 | 0.223 |
| 12662.25557 | 0.223 |
| 12672.44547 | 0.223 |
| 12682.63142 | 0.223 |
| 12692.17715 | 0.223 |
| 12702.35544 | 0.222 |
| 12712.52975 | 0.222 |
| 12722.06458 | 0.222 |
| 12732.23121 | 0.222 |
| 12742.39387 | 0.222 |
| 12752.55256 | 0.222 |
| 12762.07271 | 0.222 |
| 12772.22369 | 0.222 |
| 12782.37068 | 0.222 |
| 12792.51369 | 0.222 |
| 12802.01913 | 0.222 |
| 12812.1544 | 0.222 |
| 12822.28568 | 0.222 |
| 12832.41295 | 0.222 |
| 12842.53622 | 0.223 |
| 12852.02315 | 0.223 |
| 12862.13866 | 0.223 |
| 12872.25016 | 0.223 |
| 12882.35764 | 0.224 |
| 12892.4611 | 0.224 |
| 12901.92944 | 0.224 |
| 12912.02511 | 0.224 |
| 12922.11675 | 0.224 |
| 12932.20436 | 0.224 |
| 12942.28794 | 0.224 |
| 12952.36747 | 0.225 |
| 12962.44297 | 0.225 |
| 12971.88508 | 0.225 |
| 12981.95274 | 0.225 |
| 12992.01635 | 0.225 |
| 13002.07591 | 0.225 |
| 13012.13141 | 0.225 |
| 13022.18286 | 0.225 |
| 13032.23024 | 0.225 |
| 13042.27356 | 0.225 |
| 13052.31281 | 0.225 |
| 13062.34799 | 0.225 |
| 13072.37909 | 0.225 |
| 13081.77955 | 0.225 |
| 13091.80275 | 0.225 |
| 13101.82186 | 0.225 |
| 13111.83689 | 0.225 |
| 13121.84783 | 0.225 |
| 13131.85468 | 0.225 |
| 13141.85743 | 0.225 |
| 13151.85608 | 0.225 |
| 13161.85063 | 0.225 |
| 13171.84107 | 0.225 |
| 13181.8274 | 0.224 |
| 13191.80963 | 0.224 |
| 13201.78774 | 0.224 |
| 13211.76172 | 0.225 |
| 13221.73159 | 0.225 |
| 13231.69734 | 0.225 |
| 13241.65895 | 0.225 |
| 13252.23865 | 0.225 |
| 13262.19174 | 0.225 |
| 13272.1407 | 0.225 |
| 13282.08552 | 0.225 |
| 13292.02619 | 0.225 |
| 13301.96272 | 0.224 |
| 13311.8951 | 0.224 |
| 13321.82333 | 0.224 |
| 13331.7474 | 0.224 |
| 13341.66731 | 0.224 |
| 13351.58306 | 0.225 |
| 13362.11398 | 0.225 |
| 13372.02114 | 0.226 |
| 13381.92413 | 0.226 |
| 13391.82294 | 0.226 |
| 13401.71758 | 0.226 |
| 13411.60803 | 0.226 |
| 13422.11206 | 0.226 |
| 13431.99388 | 0.226 |
| 13441.87151 | 0.226 |
| 13451.74495 | 0.226 |
| 13461.6142 | 0.226 |
| 13472.09567 | 0.226 |
| 13481.95625 | 0.226 |
| 13491.81263 | 0.226 |
| 13501.66479 | 0.226 |
| 13511.51275 | 0.226 |
| 13521.97158 | 0.226 |
| 13531.81084 | 0.226 |
| 13541.64588 | 0.226 |
| 13551.47669 | 0.226 |
| 13561.9173 | 0.226 |
| 13571.7394 | 0.226 |
| 13581.55725 | 0.226 |
| 13591.98409 | 0.226 |
| 13601.79321 | 0.226 |
| 13611.59808 | 0.226 |
| 13621.39871 | 0.226 |
| 13631.80722 | 0.227 |
| 13641.59909 | 0.227 |
| 13651.38669 | 0.228 |
| 13661.78136 | 0.229 |
| 13671.56018 | 0.229 |
| 13681.94551 | 0.229 |
| 13691.71553 | 0.229 |
| 13701.48128 | 0.229 |
| 13711.85271 | 0.229 |
| 13721.60964 | 0.229 |
| 13731.3623 | 0.229 |
| 13741.7198 | 0.229 |
| 13751.46361 | 0.229 |
| 13761.81172 | 0.229 |
| 13771.54668 | 0.229 |
| 13781.88538 | 0.229 |
| 13791.61148 | 0.229 |
| 13801.33328 | 0.228 |
| 13811.65798 | 0.228 |
| 13821.37089 | 0.228 |
| 13831.68615 | 0.228 |
| 13841.39017 | 0.228 |
| 13851.69596 | 0.228 |
| 13861.39108 | 0.228 |
| 13871.6874 | 0.228 |
| 13881.37359 | 0.228 |
| 13891.66043 | 0.228 |
| 13901.33769 | 0.229 |
| 13911.61502 | 0.229 |
| 13921.28334 | 0.229 |
| 13931.55116 | 0.229 |
| 13941.21051 | 0.228 |
| 13951.46881 | 0.228 |
| 13961.72219 | 0.229 |
| 13971.36795 | 0.229 |
| 13981.61179 | 0.229 |
| 13991.24855 | 0.23 |
| 14001.48283 | 0.23 |
| 14011.71217 | 0.231 |
| 14021.33529 | 0.231 |
| 14031.55505 | 0.231 |
| 14041.16914 | 0.231 |
| 14051.37931 | 0.232 |
| 14061.58453 | 0.233 |
| 14071.18493 | 0.233 |
| 14081.38053 | 0.233 |
| 14091.57118 | 0.234 |
| 14101.15785 | 0.234 |
| 14111.33886 | 0.234 |
| 14121.51491 | 0.235 |
| 14131.08782 | 0.234 |
| 14141.25421 | 0.234 |
| 14151.41561 | 0.234 |
| 14161.57204 | 0.234 |
| 14171.12647 | 0.234 |
| 14181.27321 | 0.234 |
| 14191.41496 | 0.234 |
| 14201.55171 | 0.234 |
| 14211.08762 | 0.235 |
| 14221.21466 | 0.235 |
| 14231.33669 | 0.235 |
| 14241.45371 | 0.236 |
| 14250.97103 | 0.236 |
| 14261.07831 | 0.236 |
| 14271.18057 | 0.236 |
| 14281.27781 | 0.236 |
| 14291.37001 | 0.237 |
| 14301.45718 | 0.237 |
| 14310.94639 | 0.238 |
| 14321.02379 | 0.238 |
| 14331.09614 | 0.238 |
| 14341.16344 | 0.238 |
| 14351.2257 | 0.238 |
| 14361.2829 | 0.238 |
| 14371.33504 | 0.238 |
| 14381.38213 | 0.238 |
| 14391.42415 | 0.238 |
| 14400.87083 | 0.238 |
| 14410.90301 | 0.238 |
| 14420.93011 | 0.239 |
| 14430.95214 | 0.239 |
| 14440.96908 | 0.239 |
| 14450.98094 | 0.239 |
| 14460.98771 | 0.239 |
| 14470.98939 | 0.239 |
| 14480.98597 | 0.239 |
| 14490.97745 | 0.239 |
| 14500.96383 | 0.24 |
| 14510.9451 | 0.24 |
| 14520.92127 | 0.24 |
| 14530.89232 | 0.241 |
| 14540.85825 | 0.241 |
| 14550.81906 | 0.242 |
| 14560.77475 | 0.243 |
| 14571.31048 | 0.244 |
| 14581.25561 | 0.245 |
| 14591.19561 | 0.245 |
| 14601.13046 | 0.246 |
| 14611.06018 | 0.246 |
| 14620.98475 | 0.247 |
| 14630.90417 | 0.247 |
| 14640.81844 | 0.248 |
| 14650.72755 | 0.248 |
| 14661.21393 | 0.25 |
| 14671.11242 | 0.251 |
| 14681.00574 | 0.251 |
| 14690.89389 | 0.251 |
| 14700.77687 | 0.251 |
| 14710.65467 | 0.251 |
| 14721.10787 | 0.251 |
| 14730.975 | 0.251 |
| 14740.83695 | 0.252 |
| 14750.6937 | 0.252 |
| 14761.12461 | 0.253 |
| 14770.97066 | 0.253 |
| 14780.81152 | 0.254 |
| 14790.64717 | 0.255 |
| 14801.05571 | 0.256 |
| 14810.88064 | 0.256 |
| 14820.70034 | 0.256 |
| 14831.09199 | 0.257 |
| 14840.90095 | 0.258 |
| 14850.70469 | 0.259 |
| 14861.07941 | 0.259 |
| 14870.87237 | 0.259 |
| 14880.6601 | 0.26 |
| 14891.01786 | 0.26 |
| 14900.7948 | 0.26 |
| 14910.56649 | 0.262 |
| 14920.90726 | 0.264 |
| 14930.66813 | 0.266 |
| 14940.99744 | 0.267 |
| 14950.74749 | 0.267 |
| 14960.49227 | 0.267 |
| 14970.80453 | 0.267 |
| 14980.53846 | 0.268 |
| 14990.83922 | 0.268 |
| 15000.56229 | 0.268 |
| 15010.85154 | 0.27 |
| 15020.56373 | 0.271 |
| 15030.84146 | 0.273 |
| 15040.54275 | 0.274 |
| 15050.80894 | 0.274 |
| 15060.49932 | 0.273 |
| 15070.75395 | 0.273 |
| 15080.43342 | 0.274 |
| 15090.67647 | 0.274 |
| 15100.91357 | 0.274 |
| 15110.57647 | 0.274 |
| 15120.80197 | 0.274 |
| 15130.45391 | 0.275 |
| 15140.6678 | 0.277 |
| 15150.87571 | 0.279 |
| 15160.51103 | 0.28 |
| 15170.70731 | 0.28 |
| 15180.33163 | 0.28 |
| 15190.51626 | 0.28 |
| 15200.69489 | 0.28 |
| 15210.30253 | 0.281 |
| 15220.4695 | 0.282 |
| 15230.63045 | 0.284 |
| 15240.78539 | 0.285 |
| 15250.37064 | 0.286 |
| 15260.51388 | 0.287 |
| 15270.65109 | 0.287 |
| 15280.78227 | 0.287 |
| 15290.34507 | 0.287 |
| 15300.46452 | 0.287 |
| 15310.57793 | 0.287 |
| 15320.6853 | 0.287 |
| 15330.22559 | 0.288 |
| 15340.32119 | 0.288 |
| 15350.41073 | 0.288 |
| 15360.49422 | 0.288 |
| 15370.57164 | 0.289 |
| 15380.64299 | 0.289 |
| 15390.70827 | 0.29 |
| 15400.20879 | 0.292 |
| 15410.26225 | 0.292 |
| 15420.30963 | 0.293 |
| 15430.35092 | 0.293 |
| 15440.38612 | 0.293 |
| 15450.41522 | 0.294 |
| 15460.43823 | 0.294 |
| 15470.45513 | 0.295 |
| 15480.46592 | 0.295 |
| 15490.4706 | 0.295 |
| 15500.46917 | 0.295 |
| 15510.46161 | 0.296 |
| 15520.44794 | 0.295 |
| 15530.42813 | 0.295 |
| 15540.4022 | 0.295 |
| 15550.37013 | 0.295 |
| 15560.33192 | 0.295 |
| 15570.28757 | 0.295 |
| 15580.23707 | 0.296 |
| 15590.18042 | 0.296 |
| 15600.11761 | 0.296 |
| 15610.04865 | 0.296 |
| 15620.52472 | 0.297 |
| 15630.44309 | 0.297 |
| 15640.35528 | 0.297 |
| 15650.2613 | 0.298 |
| 15660.16114 | 0.298 |
| 15670.0548 | 0.298 |
| 15680.4914 | 0.298 |
| 15690.37234 | 0.298 |
| 15700.24708 | 0.299 |
| 15710.11563 | 0.299 |
| 15719.97797 | 0.3 |
| 15730.38149 | 0.3 |
| 15740.23107 | 0.301 |
| 15750.07444 | 0.301 |
| 15759.91159 | 0.302 |
| 15770.2885 | 0.303 |
| 15780.11286 | 0.304 |
| 15789.93098 | 0.304 |
| 15800.2878 | 0.304 |
| 15810.09311 | 0.304 |
| 15819.89218 | 0.304 |
| 15830.22886 | 0.305 |
| 15840.01509 | 0.305 |
| 15850.33821 | 0.306 |
| 15860.11158 | 0.307 |
| 15869.87869 | 0.308 |
| 15880.18161 | 0.309 |
| 15889.93584 | 0.309 |
| 15900.22516 | 0.31 |
| 15909.96648 | 0.31 |
| 15920.24218 | 0.31 |
| 15929.97059 | 0.31 |
| 15940.23264 | 0.311 |
| 15949.94812 | 0.311 |
| 15960.19652 | 0.311 |
| 15969.89905 | 0.311 |
| 15980.13377 | 0.312 |
| 15989.82334 | 0.312 |
| 16000.04436 | 0.312 |